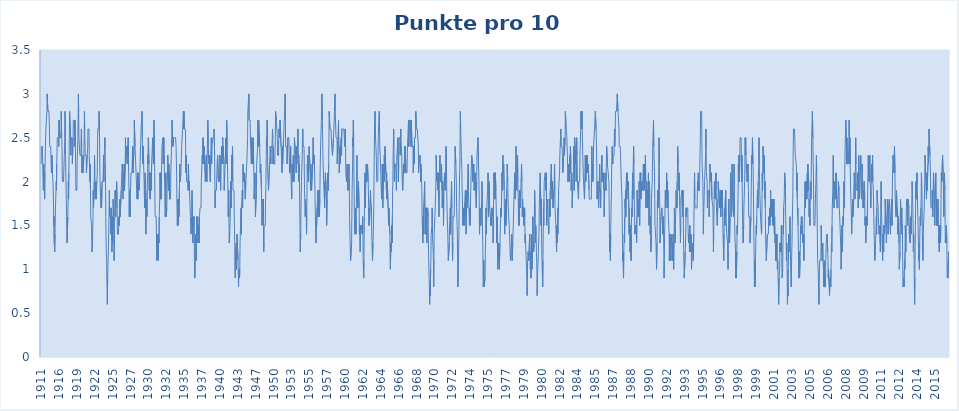
| Category | Punkte pro 10 Spiele |
|---|---|
| 1911 | 2.2 |
| 1911 | 2.4 |
| 1912 | 2.4 |
| 1912 | 2.4 |
| 1912 | 2.4 |
| 1912 | 2.4 |
| 1912 | 2.4 |
| 1912 | 2.1 |
| 1912 | 2.1 |
| 1912 | 1.9 |
| 1912 | 2.2 |
| 1912 | 2.2 |
| 1912 | 2.2 |
| 1912 | 2 |
| 1912 | 1.8 |
| 1912 | 2.1 |
| 1912 | 2.1 |
| 1912 | 2.4 |
| 1912 | 2.4 |
| 1912 | 2.6 |
| 1912 | 2.6 |
| 1913 | 2.6 |
| 1913 | 2.6 |
| 1913 | 2.8 |
| 1913 | 3 |
| 1913 | 3 |
| 1913 | 3 |
| 1913 | 2.8 |
| 1913 | 2.8 |
| 1913 | 2.8 |
| 1913 | 2.8 |
| 1913 | 2.8 |
| 1913 | 2.8 |
| 1913 | 2.6 |
| 1913 | 2.4 |
| 1913 | 2.4 |
| 1913 | 2.4 |
| 1913 | 2.4 |
| 1913 | 2.4 |
| 1914 | 2.4 |
| 1914 | 2.4 |
| 1914 | 2.1 |
| 1914 | 2.1 |
| 1914 | 2.3 |
| 1914 | 2.3 |
| 1914 | 2.1 |
| 1914 | 2.1 |
| 1914 | 2 |
| 1915 | 2 |
| 1915 | 1.8 |
| 1915 | 1.5 |
| 1915 | 1.6 |
| 1915 | 1.3 |
| 1915 | 1.3 |
| 1915 | 1.2 |
| 1915 | 1.4 |
| 1915 | 1.4 |
| 1915 | 1.7 |
| 1915 | 1.7 |
| 1915 | 1.9 |
| 1915 | 2 |
| 1915 | 1.9 |
| 1915 | 2.2 |
| 1915 | 2.2 |
| 1915 | 2.5 |
| 1915 | 2.5 |
| 1916 | 2.5 |
| 1916 | 2.5 |
| 1916 | 2.5 |
| 1916 | 2.5 |
| 1916 | 2.4 |
| 1916 | 2.7 |
| 1916 | 2.7 |
| 1916 | 2.7 |
| 1916 | 2.7 |
| 1916 | 2.5 |
| 1916 | 2.5 |
| 1916 | 2.5 |
| 1916 | 2.5 |
| 1916 | 2.5 |
| 1916 | 2.8 |
| 1916 | 2.6 |
| 1916 | 2.6 |
| 1916 | 2.4 |
| 1917 | 2.1 |
| 1917 | 2 |
| 1917 | 2 |
| 1917 | 2 |
| 1917 | 2 |
| 1917 | 2 |
| 1917 | 2 |
| 1917 | 2.2 |
| 1917 | 2.2 |
| 1917 | 2.2 |
| 1917 | 2.5 |
| 1917 | 2.8 |
| 1917 | 2.5 |
| 1917 | 2.3 |
| 1917 | 2.1 |
| 1917 | 2.1 |
| 1917 | 1.8 |
| 1917 | 1.6 |
| 1918 | 1.4 |
| 1918 | 1.3 |
| 1918 | 1.3 |
| 1918 | 1.3 |
| 1918 | 1.6 |
| 1918 | 1.8 |
| 1918 | 2 |
| 1918 | 1.8 |
| 1918 | 2.1 |
| 1918 | 2.3 |
| 1918 | 2.5 |
| 1918 | 2.8 |
| 1918 | 2.8 |
| 1918 | 2.8 |
| 1918 | 2.8 |
| 1918 | 2.5 |
| 1918 | 2.3 |
| 1918 | 2.5 |
| 1919 | 2.5 |
| 1919 | 2.5 |
| 1919 | 2.5 |
| 1919 | 2.5 |
| 1919 | 2.2 |
| 1919 | 2.2 |
| 1919 | 2.2 |
| 1919 | 2.5 |
| 1919 | 2.7 |
| 1919 | 2.7 |
| 1919 | 2.7 |
| 1919 | 2.7 |
| 1919 | 2.7 |
| 1919 | 2.4 |
| 1919 | 2.7 |
| 1919 | 2.7 |
| 1919 | 2.4 |
| 1919 | 2.2 |
| 1919 | 1.9 |
| 1919 | 1.9 |
| 1919 | 1.9 |
| 1919 | 1.9 |
| 1919 | 1.9 |
| 1919 | 2.2 |
| 1920 | 2.2 |
| 1920 | 2.2 |
| 1920 | 2.5 |
| 1920 | 2.7 |
| 1920 | 3 |
| 1920 | 2.8 |
| 1920 | 2.5 |
| 1920 | 2.5 |
| 1920 | 2.5 |
| 1920 | 2.5 |
| 1920 | 2.3 |
| 1920 | 2.3 |
| 1920 | 2.3 |
| 1920 | 2.3 |
| 1920 | 2.3 |
| 1920 | 2.5 |
| 1920 | 2.6 |
| 1920 | 2.4 |
| 1920 | 2.1 |
| 1920 | 2.1 |
| 1920 | 2.3 |
| 1920 | 2.3 |
| 1920 | 2.1 |
| 1920 | 2.1 |
| 1920 | 2.1 |
| 1920 | 2.1 |
| 1920 | 2.3 |
| 1921 | 2.5 |
| 1921 | 2.8 |
| 1921 | 2.6 |
| 1921 | 2.6 |
| 1921 | 2.3 |
| 1921 | 2.3 |
| 1921 | 2.3 |
| 1921 | 2.3 |
| 1921 | 2.3 |
| 1921 | 2.1 |
| 1921 | 2.1 |
| 1921 | 2.1 |
| 1921 | 2.3 |
| 1921 | 2.3 |
| 1921 | 2.4 |
| 1921 | 2.6 |
| 1921 | 2.6 |
| 1921 | 2.6 |
| 1921 | 2.6 |
| 1921 | 2.6 |
| 1921 | 2.3 |
| 1921 | 2.3 |
| 1921 | 2.3 |
| 1921 | 2 |
| 1921 | 2.2 |
| 1921 | 1.9 |
| 1922 | 1.6 |
| 1922 | 1.6 |
| 1922 | 1.6 |
| 1922 | 1.5 |
| 1922 | 1.5 |
| 1922 | 1.2 |
| 1922 | 1.2 |
| 1922 | 1.3 |
| 1922 | 1.3 |
| 1922 | 1.6 |
| 1922 | 1.9 |
| 1922 | 1.7 |
| 1922 | 1.7 |
| 1922 | 1.7 |
| 1922 | 2 |
| 1922 | 2.3 |
| 1922 | 2.1 |
| 1922 | 2 |
| 1922 | 1.8 |
| 1922 | 1.8 |
| 1922 | 1.8 |
| 1922 | 2 |
| 1922 | 1.8 |
| 1922 | 1.9 |
| 1922 | 1.9 |
| 1923 | 1.9 |
| 1923 | 2.1 |
| 1923 | 2.4 |
| 1923 | 2.6 |
| 1923 | 2.6 |
| 1923 | 2.6 |
| 1923 | 2.6 |
| 1923 | 2.6 |
| 1923 | 2.8 |
| 1923 | 2.8 |
| 1923 | 2.5 |
| 1923 | 2.2 |
| 1923 | 2 |
| 1923 | 2 |
| 1923 | 2 |
| 1923 | 2 |
| 1923 | 1.7 |
| 1923 | 1.9 |
| 1923 | 1.7 |
| 1923 | 1.7 |
| 1923 | 2 |
| 1923 | 2 |
| 1923 | 2 |
| 1923 | 2 |
| 1923 | 2 |
| 1923 | 2 |
| 1923 | 2.3 |
| 1923 | 2 |
| 1924 | 2.2 |
| 1924 | 2.2 |
| 1924 | 2.2 |
| 1924 | 2.5 |
| 1924 | 2.4 |
| 1924 | 2.2 |
| 1924 | 1.9 |
| 1924 | 1.6 |
| 1924 | 1.3 |
| 1924 | 1.3 |
| 1924 | 1.1 |
| 1924 | 0.9 |
| 1924 | 0.9 |
| 1924 | 0.6 |
| 1924 | 0.9 |
| 1924 | 0.9 |
| 1924 | 0.9 |
| 1924 | 1.2 |
| 1924 | 1.2 |
| 1924 | 1.5 |
| 1924 | 1.7 |
| 1924 | 1.9 |
| 1924 | 1.6 |
| 1924 | 1.6 |
| 1925 | 1.6 |
| 1925 | 1.6 |
| 1925 | 1.6 |
| 1925 | 1.4 |
| 1925 | 1.7 |
| 1925 | 1.5 |
| 1925 | 1.5 |
| 1925 | 1.2 |
| 1925 | 1.3 |
| 1925 | 1.6 |
| 1925 | 1.3 |
| 1925 | 1.5 |
| 1925 | 1.8 |
| 1925 | 1.7 |
| 1925 | 1.5 |
| 1925 | 1.4 |
| 1925 | 1.1 |
| 1925 | 1.4 |
| 1925 | 1.6 |
| 1925 | 1.6 |
| 1925 | 1.9 |
| 1926 | 1.9 |
| 1926 | 1.6 |
| 1926 | 1.9 |
| 1926 | 1.8 |
| 1926 | 1.9 |
| 1926 | 2 |
| 1926 | 2 |
| 1926 | 1.7 |
| 1926 | 1.4 |
| 1926 | 1.4 |
| 1926 | 1.4 |
| 1926 | 1.4 |
| 1926 | 1.4 |
| 1926 | 1.4 |
| 1926 | 1.6 |
| 1926 | 1.5 |
| 1926 | 1.5 |
| 1926 | 1.5 |
| 1926 | 1.8 |
| 1926 | 1.6 |
| 1926 | 1.6 |
| 1926 | 1.6 |
| 1926 | 1.6 |
| 1926 | 1.9 |
| 1926 | 1.9 |
| 1927 | 1.9 |
| 1927 | 1.9 |
| 1927 | 2.2 |
| 1927 | 2.2 |
| 1927 | 2.1 |
| 1927 | 1.8 |
| 1927 | 2.1 |
| 1927 | 2.1 |
| 1927 | 2.1 |
| 1927 | 1.9 |
| 1927 | 2.2 |
| 1927 | 1.9 |
| 1927 | 1.9 |
| 1927 | 1.9 |
| 1927 | 2.2 |
| 1927 | 2.5 |
| 1927 | 2.2 |
| 1927 | 2.2 |
| 1927 | 2.2 |
| 1927 | 2.4 |
| 1927 | 2.4 |
| 1927 | 2.4 |
| 1927 | 2.4 |
| 1927 | 2.4 |
| 1927 | 2.2 |
| 1927 | 2.2 |
| 1927 | 2.5 |
| 1927 | 2.2 |
| 1927 | 2.2 |
| 1927 | 1.9 |
| 1927 | 1.6 |
| 1927 | 1.9 |
| 1927 | 1.9 |
| 1927 | 1.6 |
| 1927 | 1.8 |
| 1927 | 1.8 |
| 1927 | 1.8 |
| 1928 | 2.1 |
| 1928 | 2.1 |
| 1928 | 2.1 |
| 1928 | 2.1 |
| 1928 | 2.1 |
| 1928 | 2.1 |
| 1928 | 2.4 |
| 1928 | 2.4 |
| 1928 | 2.1 |
| 1928 | 2.1 |
| 1928 | 2.1 |
| 1928 | 2.1 |
| 1928 | 2.4 |
| 1928 | 2.7 |
| 1928 | 2.7 |
| 1928 | 2.7 |
| 1928 | 2.4 |
| 1928 | 2.4 |
| 1928 | 2.4 |
| 1928 | 2.4 |
| 1928 | 2.1 |
| 1928 | 2.1 |
| 1928 | 2.1 |
| 1928 | 2.1 |
| 1928 | 1.8 |
| 1928 | 1.8 |
| 1928 | 2.1 |
| 1928 | 1.8 |
| 1928 | 2.1 |
| 1928 | 1.9 |
| 1928 | 1.9 |
| 1929 | 1.9 |
| 1929 | 1.9 |
| 1929 | 1.9 |
| 1929 | 2 |
| 1929 | 2 |
| 1929 | 2 |
| 1929 | 2.3 |
| 1929 | 2.3 |
| 1929 | 2.3 |
| 1929 | 2.6 |
| 1929 | 2.6 |
| 1929 | 2.6 |
| 1929 | 2.6 |
| 1929 | 2.8 |
| 1929 | 2.5 |
| 1929 | 2.2 |
| 1929 | 2.2 |
| 1929 | 2.2 |
| 1929 | 2.4 |
| 1929 | 2.2 |
| 1929 | 2.2 |
| 1929 | 2 |
| 1929 | 2 |
| 1929 | 1.7 |
| 1929 | 2 |
| 1929 | 2.1 |
| 1929 | 1.9 |
| 1929 | 1.7 |
| 1929 | 1.4 |
| 1929 | 1.6 |
| 1929 | 1.6 |
| 1929 | 1.8 |
| 1929 | 1.6 |
| 1929 | 1.9 |
| 1929 | 1.9 |
| 1930 | 2.1 |
| 1930 | 2.3 |
| 1930 | 2.2 |
| 1930 | 2.5 |
| 1930 | 2.5 |
| 1930 | 2.2 |
| 1930 | 1.9 |
| 1930 | 2.1 |
| 1930 | 2.1 |
| 1930 | 2.1 |
| 1930 | 1.8 |
| 1930 | 1.8 |
| 1930 | 2.1 |
| 1930 | 2.1 |
| 1930 | 1.9 |
| 1930 | 1.9 |
| 1930 | 2.2 |
| 1930 | 2.2 |
| 1930 | 2.2 |
| 1930 | 2.2 |
| 1930 | 2.5 |
| 1930 | 2.5 |
| 1930 | 2.5 |
| 1930 | 2.2 |
| 1930 | 2.4 |
| 1930 | 2.7 |
| 1930 | 2.7 |
| 1930 | 2.4 |
| 1930 | 2.1 |
| 1931 | 1.8 |
| 1931 | 1.6 |
| 1931 | 1.6 |
| 1931 | 1.6 |
| 1931 | 1.6 |
| 1931 | 1.6 |
| 1931 | 1.4 |
| 1931 | 1.1 |
| 1931 | 1.1 |
| 1931 | 1.2 |
| 1931 | 1.2 |
| 1931 | 1.4 |
| 1931 | 1.4 |
| 1931 | 1.1 |
| 1931 | 1.4 |
| 1931 | 1.4 |
| 1931 | 1.3 |
| 1931 | 1.6 |
| 1931 | 1.6 |
| 1931 | 1.8 |
| 1931 | 2.1 |
| 1931 | 2.1 |
| 1931 | 1.8 |
| 1931 | 2.1 |
| 1931 | 2.1 |
| 1931 | 1.8 |
| 1931 | 2.1 |
| 1931 | 2.1 |
| 1931 | 2.4 |
| 1932 | 2.4 |
| 1932 | 2.4 |
| 1932 | 2.4 |
| 1932 | 2.5 |
| 1932 | 2.2 |
| 1932 | 2.2 |
| 1932 | 2.5 |
| 1932 | 2.5 |
| 1932 | 2.2 |
| 1932 | 2.2 |
| 1932 | 1.9 |
| 1932 | 1.9 |
| 1932 | 1.6 |
| 1932 | 1.8 |
| 1932 | 2.1 |
| 1932 | 1.9 |
| 1932 | 1.6 |
| 1932 | 1.6 |
| 1932 | 1.7 |
| 1932 | 1.7 |
| 1932 | 2 |
| 1932 | 2 |
| 1932 | 2.3 |
| 1932 | 2.3 |
| 1932 | 2 |
| 1932 | 1.9 |
| 1933 | 2.2 |
| 1933 | 1.9 |
| 1933 | 2.1 |
| 1933 | 1.8 |
| 1933 | 1.8 |
| 1933 | 1.8 |
| 1933 | 1.8 |
| 1933 | 1.8 |
| 1933 | 2.1 |
| 1933 | 2.1 |
| 1933 | 2.1 |
| 1933 | 2.4 |
| 1933 | 2.4 |
| 1933 | 2.7 |
| 1933 | 2.7 |
| 1933 | 2.7 |
| 1933 | 2.4 |
| 1933 | 2.4 |
| 1933 | 2.4 |
| 1933 | 2.5 |
| 1933 | 2.5 |
| 1933 | 2.5 |
| 1933 | 2.5 |
| 1933 | 2.5 |
| 1934 | 2.5 |
| 1934 | 2.5 |
| 1934 | 2.5 |
| 1934 | 2.5 |
| 1934 | 2.5 |
| 1934 | 2.4 |
| 1934 | 2.4 |
| 1934 | 2.1 |
| 1934 | 1.8 |
| 1934 | 1.8 |
| 1934 | 1.5 |
| 1934 | 1.5 |
| 1934 | 1.8 |
| 1934 | 1.8 |
| 1934 | 1.5 |
| 1934 | 1.8 |
| 1934 | 1.6 |
| 1934 | 1.6 |
| 1934 | 1.9 |
| 1934 | 1.9 |
| 1934 | 2.2 |
| 1934 | 2 |
| 1934 | 2 |
| 1934 | 2 |
| 1934 | 2.1 |
| 1934 | 2.1 |
| 1934 | 2.1 |
| 1934 | 2.4 |
| 1934 | 2.4 |
| 1934 | 2.4 |
| 1935 | 2.4 |
| 1935 | 2.6 |
| 1935 | 2.6 |
| 1935 | 2.6 |
| 1935 | 2.8 |
| 1935 | 2.6 |
| 1935 | 2.8 |
| 1935 | 2.8 |
| 1935 | 2.6 |
| 1935 | 2.6 |
| 1935 | 2.6 |
| 1935 | 2.6 |
| 1935 | 2.6 |
| 1935 | 2.4 |
| 1935 | 2.1 |
| 1935 | 2.3 |
| 1935 | 2.3 |
| 1935 | 2 |
| 1935 | 2 |
| 1935 | 2 |
| 1935 | 2 |
| 1935 | 2 |
| 1935 | 2 |
| 1935 | 1.9 |
| 1935 | 2.2 |
| 1935 | 2.2 |
| 1935 | 1.9 |
| 1935 | 2 |
| 1935 | 1.9 |
| 1935 | 1.9 |
| 1935 | 1.9 |
| 1935 | 1.9 |
| 1936 | 1.6 |
| 1936 | 1.6 |
| 1936 | 1.4 |
| 1936 | 1.4 |
| 1936 | 1.4 |
| 1936 | 1.6 |
| 1936 | 1.9 |
| 1936 | 1.9 |
| 1936 | 1.6 |
| 1936 | 1.3 |
| 1936 | 1.3 |
| 1936 | 1.6 |
| 1936 | 1.5 |
| 1936 | 1.5 |
| 1936 | 1.6 |
| 1936 | 1.3 |
| 1936 | 1.1 |
| 1936 | 0.9 |
| 1936 | 0.9 |
| 1936 | 1 |
| 1936 | 1.3 |
| 1936 | 1.3 |
| 1936 | 1.4 |
| 1936 | 1.1 |
| 1936 | 1.3 |
| 1937 | 1.6 |
| 1937 | 1.5 |
| 1937 | 1.4 |
| 1937 | 1.4 |
| 1937 | 1.6 |
| 1937 | 1.3 |
| 1937 | 1.3 |
| 1937 | 1.5 |
| 1937 | 1.5 |
| 1937 | 1.3 |
| 1937 | 1.3 |
| 1937 | 1.6 |
| 1937 | 1.6 |
| 1937 | 1.7 |
| 1937 | 1.7 |
| 1937 | 1.7 |
| 1937 | 1.7 |
| 1937 | 1.7 |
| 1937 | 2 |
| 1937 | 2 |
| 1937 | 2 |
| 1937 | 2 |
| 1937 | 2.3 |
| 1938 | 2.2 |
| 1938 | 2.2 |
| 1938 | 2.5 |
| 1938 | 2.5 |
| 1938 | 2.5 |
| 1938 | 2.2 |
| 1938 | 2.4 |
| 1938 | 2.4 |
| 1938 | 2.2 |
| 1938 | 2.2 |
| 1938 | 2.2 |
| 1938 | 2 |
| 1938 | 2 |
| 1938 | 2 |
| 1938 | 2 |
| 1938 | 2.3 |
| 1938 | 2.3 |
| 1938 | 2 |
| 1938 | 2.2 |
| 1938 | 2.2 |
| 1938 | 2.5 |
| 1938 | 2.7 |
| 1939 | 2.7 |
| 1939 | 2.4 |
| 1939 | 2.4 |
| 1939 | 2.2 |
| 1939 | 2.2 |
| 1939 | 2.3 |
| 1939 | 2.3 |
| 1939 | 2.3 |
| 1939 | 2.3 |
| 1939 | 2 |
| 1939 | 2 |
| 1939 | 2.3 |
| 1939 | 2.3 |
| 1939 | 2.5 |
| 1939 | 2.2 |
| 1939 | 2.4 |
| 1939 | 2.4 |
| 1939 | 2.4 |
| 1939 | 2.4 |
| 1939 | 2.5 |
| 1939 | 2.5 |
| 1940 | 2.5 |
| 1940 | 2.5 |
| 1940 | 2.5 |
| 1940 | 2.6 |
| 1940 | 2.6 |
| 1940 | 2.3 |
| 1940 | 2 |
| 1940 | 1.7 |
| 1940 | 1.9 |
| 1940 | 1.9 |
| 1940 | 1.9 |
| 1940 | 1.9 |
| 1940 | 1.9 |
| 1940 | 1.9 |
| 1940 | 1.9 |
| 1940 | 2.2 |
| 1940 | 2.2 |
| 1940 | 2.3 |
| 1940 | 2.3 |
| 1940 | 2.3 |
| 1940 | 2 |
| 1940 | 2 |
| 1940 | 2 |
| 1940 | 2 |
| 1940 | 2 |
| 1940 | 2 |
| 1940 | 2.3 |
| 1940 | 2.2 |
| 1940 | 2.2 |
| 1940 | 1.9 |
| 1940 | 2.2 |
| 1940 | 2.2 |
| 1941 | 2.2 |
| 1941 | 2.4 |
| 1941 | 2.4 |
| 1941 | 2.2 |
| 1941 | 2.2 |
| 1941 | 2.5 |
| 1941 | 2.3 |
| 1941 | 2.4 |
| 1941 | 2.4 |
| 1941 | 2.4 |
| 1941 | 2.2 |
| 1941 | 1.9 |
| 1941 | 1.9 |
| 1941 | 2.1 |
| 1941 | 2.1 |
| 1941 | 2.1 |
| 1941 | 2.3 |
| 1941 | 2.5 |
| 1941 | 2.5 |
| 1941 | 2.2 |
| 1941 | 2.4 |
| 1941 | 2.7 |
| 1941 | 2.7 |
| 1941 | 2.4 |
| 1941 | 2.2 |
| 1941 | 2.2 |
| 1941 | 1.9 |
| 1941 | 1.6 |
| 1941 | 1.6 |
| 1942 | 1.9 |
| 1942 | 1.6 |
| 1942 | 1.3 |
| 1942 | 1.3 |
| 1942 | 1.4 |
| 1942 | 1.4 |
| 1942 | 1.4 |
| 1942 | 1.7 |
| 1942 | 2 |
| 1942 | 2 |
| 1942 | 1.7 |
| 1942 | 2 |
| 1942 | 2.3 |
| 1942 | 2 |
| 1942 | 2.2 |
| 1942 | 2.4 |
| 1942 | 2.2 |
| 1942 | 1.9 |
| 1942 | 1.9 |
| 1942 | 1.9 |
| 1942 | 1.9 |
| 1942 | 1.9 |
| 1942 | 1.6 |
| 1943 | 1.6 |
| 1943 | 1.3 |
| 1943 | 1 |
| 1943 | 0.9 |
| 1943 | 1.2 |
| 1943 | 1.2 |
| 1943 | 1.2 |
| 1943 | 1.3 |
| 1943 | 1 |
| 1943 | 1.3 |
| 1943 | 1.4 |
| 1943 | 1.4 |
| 1943 | 1.4 |
| 1943 | 1.4 |
| 1943 | 1.1 |
| 1943 | 1.1 |
| 1943 | 0.8 |
| 1943 | 1 |
| 1943 | 1 |
| 1944 | 1 |
| 1944 | 0.9 |
| 1944 | 1 |
| 1944 | 1.3 |
| 1944 | 1.4 |
| 1944 | 1.4 |
| 1944 | 1.4 |
| 1944 | 1.7 |
| 1944 | 1.4 |
| 1944 | 1.7 |
| 1944 | 1.7 |
| 1944 | 1.7 |
| 1944 | 1.9 |
| 1944 | 1.7 |
| 1944 | 1.9 |
| 1944 | 2.2 |
| 1944 | 2 |
| 1945 | 2 |
| 1945 | 2 |
| 1945 | 2 |
| 1945 | 2 |
| 1945 | 2.1 |
| 1945 | 2.1 |
| 1945 | 2.1 |
| 1945 | 1.8 |
| 1945 | 1.8 |
| 1945 | 2 |
| 1945 | 2 |
| 1945 | 2.1 |
| 1945 | 2.1 |
| 1946 | 2.1 |
| 1946 | 2.3 |
| 1946 | 2.3 |
| 1946 | 2.5 |
| 1946 | 2.8 |
| 1946 | 2.8 |
| 1946 | 2.8 |
| 1946 | 2.8 |
| 1946 | 3 |
| 1946 | 2.7 |
| 1946 | 2.7 |
| 1946 | 2.7 |
| 1946 | 2.7 |
| 1946 | 2.7 |
| 1946 | 2.7 |
| 1946 | 2.4 |
| 1946 | 2.4 |
| 1946 | 2.4 |
| 1946 | 2.2 |
| 1946 | 2.5 |
| 1946 | 2.5 |
| 1946 | 2.5 |
| 1946 | 2.2 |
| 1946 | 2.2 |
| 1946 | 2.2 |
| 1946 | 2.5 |
| 1946 | 2.5 |
| 1947 | 2.2 |
| 1947 | 2.1 |
| 1947 | 1.8 |
| 1947 | 1.8 |
| 1947 | 1.8 |
| 1947 | 2.1 |
| 1947 | 1.9 |
| 1947 | 1.6 |
| 1947 | 1.6 |
| 1947 | 1.6 |
| 1947 | 1.6 |
| 1947 | 1.9 |
| 1947 | 2.2 |
| 1947 | 2.2 |
| 1947 | 2.2 |
| 1947 | 2.2 |
| 1947 | 2.4 |
| 1947 | 2.7 |
| 1947 | 2.4 |
| 1947 | 2.4 |
| 1947 | 2.7 |
| 1947 | 2.7 |
| 1947 | 2.7 |
| 1948 | 2.7 |
| 1948 | 2.4 |
| 1948 | 2.4 |
| 1948 | 2.1 |
| 1948 | 2.1 |
| 1948 | 2.2 |
| 1948 | 2.2 |
| 1948 | 2.2 |
| 1948 | 1.9 |
| 1948 | 1.7 |
| 1948 | 1.5 |
| 1948 | 1.5 |
| 1948 | 1.5 |
| 1948 | 1.8 |
| 1948 | 1.6 |
| 1948 | 1.8 |
| 1948 | 1.5 |
| 1948 | 1.2 |
| 1948 | 1.3 |
| 1948 | 1.5 |
| 1949 | 1.5 |
| 1949 | 1.5 |
| 1949 | 1.5 |
| 1949 | 1.5 |
| 1949 | 1.7 |
| 1949 | 1.7 |
| 1949 | 2 |
| 1949 | 2.3 |
| 1949 | 2.5 |
| 1949 | 2.5 |
| 1949 | 2.4 |
| 1949 | 2.7 |
| 1949 | 2.4 |
| 1949 | 2.1 |
| 1949 | 2.1 |
| 1949 | 2.1 |
| 1949 | 1.9 |
| 1949 | 1.9 |
| 1949 | 1.9 |
| 1949 | 1.9 |
| 1949 | 2.2 |
| 1949 | 2.2 |
| 1949 | 2.3 |
| 1950 | 2.4 |
| 1950 | 2.4 |
| 1950 | 2.2 |
| 1950 | 2.4 |
| 1950 | 2.4 |
| 1950 | 2.4 |
| 1950 | 2.4 |
| 1950 | 2.4 |
| 1950 | 2.4 |
| 1950 | 2.6 |
| 1950 | 2.5 |
| 1950 | 2.2 |
| 1950 | 2.4 |
| 1950 | 2.4 |
| 1950 | 2.2 |
| 1950 | 2.2 |
| 1950 | 2.2 |
| 1950 | 2.2 |
| 1950 | 2.2 |
| 1950 | 2.2 |
| 1950 | 2.5 |
| 1950 | 2.8 |
| 1950 | 2.8 |
| 1950 | 2.8 |
| 1951 | 2.7 |
| 1951 | 2.7 |
| 1951 | 2.7 |
| 1951 | 2.7 |
| 1951 | 2.5 |
| 1951 | 2.3 |
| 1951 | 2.3 |
| 1951 | 2.3 |
| 1951 | 2.3 |
| 1951 | 2.3 |
| 1951 | 2.6 |
| 1951 | 2.6 |
| 1951 | 2.6 |
| 1951 | 2.6 |
| 1951 | 2.5 |
| 1951 | 2.7 |
| 1951 | 2.7 |
| 1951 | 2.7 |
| 1951 | 2.7 |
| 1951 | 2.4 |
| 1951 | 2.4 |
| 1951 | 2.4 |
| 1951 | 2.4 |
| 1951 | 2.1 |
| 1951 | 2.4 |
| 1951 | 2.2 |
| 1951 | 2.2 |
| 1952 | 2.2 |
| 1952 | 2.2 |
| 1952 | 2.5 |
| 1952 | 2.5 |
| 1952 | 2.5 |
| 1952 | 2.5 |
| 1952 | 2.8 |
| 1952 | 2.8 |
| 1952 | 3 |
| 1952 | 2.7 |
| 1952 | 2.4 |
| 1952 | 2.4 |
| 1952 | 2.4 |
| 1952 | 2.4 |
| 1952 | 2.4 |
| 1952 | 2.4 |
| 1952 | 2.2 |
| 1952 | 2.2 |
| 1952 | 2.2 |
| 1952 | 2.5 |
| 1952 | 2.5 |
| 1952 | 2.5 |
| 1952 | 2.5 |
| 1952 | 2.5 |
| 1952 | 2.5 |
| 1952 | 2.2 |
| 1953 | 2.1 |
| 1953 | 2.1 |
| 1953 | 2.1 |
| 1953 | 2.1 |
| 1953 | 2.4 |
| 1953 | 2.1 |
| 1953 | 2.1 |
| 1953 | 2.1 |
| 1953 | 1.8 |
| 1953 | 1.9 |
| 1953 | 2.2 |
| 1953 | 2 |
| 1953 | 2 |
| 1953 | 2 |
| 1953 | 2 |
| 1953 | 2.3 |
| 1953 | 2.3 |
| 1953 | 2 |
| 1953 | 2.3 |
| 1953 | 2.5 |
| 1953 | 2.5 |
| 1953 | 2.5 |
| 1953 | 2.5 |
| 1953 | 2.3 |
| 1953 | 2.3 |
| 1953 | 2.3 |
| 1953 | 2.1 |
| 1953 | 2.4 |
| 1953 | 2.2 |
| 1954 | 2.2 |
| 1954 | 2.2 |
| 1954 | 2.4 |
| 1954 | 2.4 |
| 1954 | 2.6 |
| 1954 | 2.4 |
| 1954 | 2.1 |
| 1954 | 2.3 |
| 1954 | 2 |
| 1954 | 2.2 |
| 1954 | 2 |
| 1954 | 1.7 |
| 1954 | 1.5 |
| 1954 | 1.2 |
| 1954 | 1.2 |
| 1954 | 1.4 |
| 1954 | 1.7 |
| 1954 | 1.7 |
| 1954 | 2 |
| 1954 | 2 |
| 1954 | 2.2 |
| 1954 | 2.3 |
| 1954 | 2.3 |
| 1955 | 2.6 |
| 1955 | 2.4 |
| 1955 | 2.4 |
| 1955 | 2.4 |
| 1955 | 2.4 |
| 1955 | 2.4 |
| 1955 | 2.2 |
| 1955 | 1.9 |
| 1955 | 1.8 |
| 1955 | 1.8 |
| 1955 | 1.6 |
| 1955 | 1.8 |
| 1955 | 1.8 |
| 1955 | 1.8 |
| 1955 | 1.6 |
| 1955 | 1.4 |
| 1955 | 1.6 |
| 1955 | 1.9 |
| 1955 | 2.2 |
| 1955 | 2.1 |
| 1955 | 2.3 |
| 1955 | 2.3 |
| 1955 | 2 |
| 1955 | 2 |
| 1955 | 2.2 |
| 1955 | 2.4 |
| 1955 | 2.4 |
| 1955 | 2.4 |
| 1956 | 2.2 |
| 1956 | 2.2 |
| 1956 | 2.2 |
| 1956 | 1.9 |
| 1956 | 2.2 |
| 1956 | 2.2 |
| 1956 | 2.2 |
| 1956 | 1.9 |
| 1956 | 1.9 |
| 1956 | 1.9 |
| 1956 | 1.9 |
| 1956 | 2.2 |
| 1956 | 2.2 |
| 1956 | 2.5 |
| 1956 | 2.5 |
| 1956 | 2.5 |
| 1956 | 2.2 |
| 1956 | 2.3 |
| 1956 | 2.3 |
| 1956 | 2.1 |
| 1956 | 2.1 |
| 1956 | 1.8 |
| 1956 | 1.6 |
| 1956 | 1.6 |
| 1956 | 1.6 |
| 1956 | 1.3 |
| 1956 | 1.6 |
| 1956 | 1.5 |
| 1956 | 1.5 |
| 1956 | 1.7 |
| 1956 | 1.7 |
| 1956 | 1.7 |
| 1956 | 1.9 |
| 1956 | 1.6 |
| 1956 | 1.6 |
| 1956 | 1.9 |
| 1956 | 1.6 |
| 1956 | 1.9 |
| 1956 | 1.6 |
| 1957 | 1.6 |
| 1957 | 1.8 |
| 1957 | 2.1 |
| 1957 | 2.1 |
| 1957 | 2.4 |
| 1957 | 2.4 |
| 1957 | 2.4 |
| 1957 | 2.7 |
| 1957 | 2.7 |
| 1957 | 3 |
| 1957 | 3 |
| 1957 | 2.7 |
| 1957 | 2.5 |
| 1957 | 2.3 |
| 1957 | 2.3 |
| 1957 | 2.3 |
| 1957 | 2 |
| 1957 | 2 |
| 1957 | 2 |
| 1957 | 2 |
| 1957 | 1.7 |
| 1957 | 2 |
| 1957 | 1.9 |
| 1957 | 2.1 |
| 1957 | 2.1 |
| 1957 | 2.1 |
| 1957 | 2.1 |
| 1957 | 1.8 |
| 1957 | 1.5 |
| 1957 | 1.5 |
| 1957 | 1.8 |
| 1957 | 1.8 |
| 1957 | 2.1 |
| 1957 | 2.1 |
| 1958 | 2.1 |
| 1958 | 1.9 |
| 1958 | 2.2 |
| 1958 | 2.5 |
| 1958 | 2.8 |
| 1958 | 2.8 |
| 1958 | 2.8 |
| 1958 | 2.6 |
| 1958 | 2.6 |
| 1958 | 2.6 |
| 1958 | 2.6 |
| 1958 | 2.6 |
| 1958 | 2.6 |
| 1958 | 2.6 |
| 1958 | 2.4 |
| 1958 | 2.4 |
| 1958 | 2.4 |
| 1958 | 2.3 |
| 1958 | 2.3 |
| 1958 | 2.3 |
| 1958 | 2.3 |
| 1958 | 2.5 |
| 1958 | 2.5 |
| 1958 | 2.5 |
| 1958 | 2.7 |
| 1959 | 2.7 |
| 1959 | 2.7 |
| 1959 | 3 |
| 1959 | 2.8 |
| 1959 | 2.8 |
| 1959 | 2.8 |
| 1959 | 2.5 |
| 1959 | 2.5 |
| 1959 | 2.5 |
| 1959 | 2.5 |
| 1959 | 2.5 |
| 1959 | 2.2 |
| 1959 | 2.2 |
| 1959 | 2.4 |
| 1959 | 2.4 |
| 1959 | 2.4 |
| 1959 | 2.7 |
| 1959 | 2.4 |
| 1959 | 2.4 |
| 1959 | 2.1 |
| 1959 | 2.1 |
| 1959 | 2.4 |
| 1959 | 2.4 |
| 1959 | 2.2 |
| 1959 | 2.2 |
| 1959 | 2.2 |
| 1959 | 2.2 |
| 1959 | 2.5 |
| 1959 | 2.3 |
| 1959 | 2.6 |
| 1959 | 2.6 |
| 1960 | 2.6 |
| 1960 | 2.6 |
| 1960 | 2.6 |
| 1960 | 2.6 |
| 1960 | 2.6 |
| 1960 | 2.6 |
| 1960 | 2.6 |
| 1960 | 2.6 |
| 1960 | 2.6 |
| 1960 | 2.6 |
| 1960 | 2.4 |
| 1960 | 2.4 |
| 1960 | 2.6 |
| 1960 | 2.4 |
| 1960 | 2.1 |
| 1960 | 2.1 |
| 1960 | 2.1 |
| 1960 | 2 |
| 1960 | 2 |
| 1960 | 2 |
| 1960 | 2.2 |
| 1960 | 2.2 |
| 1960 | 1.9 |
| 1960 | 2.1 |
| 1960 | 2.1 |
| 1960 | 2.1 |
| 1960 | 2.1 |
| 1960 | 2.2 |
| 1960 | 1.9 |
| 1960 | 1.6 |
| 1960 | 1.6 |
| 1960 | 1.3 |
| 1960 | 1.3 |
| 1960 | 1.1 |
| 1960 | 1.1 |
| 1960 | 1.1 |
| 1960 | 1.1 |
| 1961 | 1.3 |
| 1961 | 1.6 |
| 1961 | 1.9 |
| 1961 | 1.9 |
| 1961 | 2.2 |
| 1961 | 2.5 |
| 1961 | 2.4 |
| 1961 | 2.7 |
| 1961 | 2.5 |
| 1961 | 2.2 |
| 1961 | 1.9 |
| 1961 | 1.6 |
| 1961 | 1.6 |
| 1961 | 1.4 |
| 1961 | 1.4 |
| 1961 | 1.4 |
| 1961 | 1.7 |
| 1961 | 1.4 |
| 1961 | 1.6 |
| 1961 | 1.7 |
| 1961 | 2 |
| 1961 | 2.3 |
| 1961 | 2 |
| 1961 | 2 |
| 1961 | 2 |
| 1961 | 1.7 |
| 1961 | 1.7 |
| 1961 | 2 |
| 1961 | 2 |
| 1961 | 2 |
| 1961 | 1.7 |
| 1961 | 1.4 |
| 1961 | 1.5 |
| 1961 | 1.4 |
| 1961 | 1.2 |
| 1961 | 1.5 |
| 1961 | 1.5 |
| 1961 | 1.5 |
| 1961 | 1.5 |
| 1962 | 1.5 |
| 1962 | 1.5 |
| 1962 | 1.5 |
| 1962 | 1.4 |
| 1962 | 1.4 |
| 1962 | 1.6 |
| 1962 | 1.4 |
| 1962 | 1.1 |
| 1962 | 1.1 |
| 1962 | 0.9 |
| 1962 | 1.1 |
| 1962 | 1.4 |
| 1962 | 1.7 |
| 1962 | 2 |
| 1962 | 2.1 |
| 1962 | 1.8 |
| 1962 | 1.7 |
| 1962 | 2 |
| 1962 | 2 |
| 1962 | 2.2 |
| 1962 | 2.2 |
| 1962 | 2 |
| 1962 | 2 |
| 1962 | 2 |
| 1962 | 2.2 |
| 1962 | 2.2 |
| 1962 | 2.2 |
| 1962 | 2 |
| 1962 | 2 |
| 1962 | 1.7 |
| 1963 | 1.5 |
| 1963 | 1.7 |
| 1963 | 1.5 |
| 1963 | 1.5 |
| 1963 | 1.5 |
| 1963 | 1.8 |
| 1963 | 1.9 |
| 1963 | 1.8 |
| 1963 | 1.8 |
| 1963 | 1.8 |
| 1963 | 1.7 |
| 1963 | 1.4 |
| 1963 | 1.3 |
| 1963 | 1.3 |
| 1963 | 1.1 |
| 1963 | 1.1 |
| 1963 | 1.3 |
| 1963 | 1.4 |
| 1963 | 1.4 |
| 1963 | 1.7 |
| 1963 | 2 |
| 1963 | 2.3 |
| 1963 | 2.6 |
| 1963 | 2.6 |
| 1963 | 2.8 |
| 1963 | 2.8 |
| 1963 | 2.5 |
| 1963 | 2.5 |
| 1963 | 2.5 |
| 1963 | 2.3 |
| 1963 | 2.3 |
| 1963 | 2 |
| 1963 | 2 |
| 1963 | 2 |
| 1963 | 2 |
| 1964 | 2 |
| 1964 | 2.3 |
| 1964 | 2.5 |
| 1964 | 2.5 |
| 1964 | 2.7 |
| 1964 | 2.7 |
| 1964 | 2.8 |
| 1964 | 2.6 |
| 1964 | 2.4 |
| 1964 | 2.4 |
| 1964 | 2.4 |
| 1964 | 2.4 |
| 1964 | 2.1 |
| 1964 | 2.1 |
| 1964 | 1.9 |
| 1964 | 1.9 |
| 1964 | 1.8 |
| 1964 | 2 |
| 1964 | 2.2 |
| 1964 | 1.9 |
| 1964 | 1.7 |
| 1964 | 1.7 |
| 1964 | 2 |
| 1964 | 2 |
| 1964 | 2.2 |
| 1964 | 2 |
| 1964 | 2.3 |
| 1964 | 2.3 |
| 1964 | 2.1 |
| 1964 | 2.4 |
| 1964 | 2.4 |
| 1964 | 2.4 |
| 1964 | 2.1 |
| 1964 | 2.1 |
| 1964 | 1.9 |
| 1964 | 2.1 |
| 1964 | 1.8 |
| 1964 | 1.8 |
| 1965 | 2 |
| 1965 | 2 |
| 1965 | 2 |
| 1965 | 1.7 |
| 1965 | 1.7 |
| 1965 | 1.5 |
| 1965 | 1.7 |
| 1965 | 1.7 |
| 1965 | 1.7 |
| 1965 | 1.7 |
| 1965 | 1.4 |
| 1965 | 1.1 |
| 1965 | 1 |
| 1965 | 1 |
| 1965 | 1.3 |
| 1965 | 1.2 |
| 1965 | 1.2 |
| 1965 | 1.2 |
| 1965 | 1.5 |
| 1965 | 1.3 |
| 1965 | 1.6 |
| 1965 | 1.9 |
| 1965 | 2 |
| 1965 | 2.3 |
| 1965 | 2.3 |
| 1965 | 2.6 |
| 1965 | 2.4 |
| 1965 | 2.2 |
| 1965 | 2 |
| 1965 | 2.2 |
| 1966 | 2.2 |
| 1966 | 2.2 |
| 1966 | 2.2 |
| 1966 | 2.2 |
| 1966 | 2.2 |
| 1966 | 2 |
| 1966 | 1.9 |
| 1966 | 2.1 |
| 1966 | 2.3 |
| 1966 | 2.3 |
| 1966 | 2.3 |
| 1966 | 2.3 |
| 1966 | 2.5 |
| 1966 | 2.2 |
| 1966 | 2 |
| 1966 | 2.2 |
| 1966 | 2.5 |
| 1966 | 2.5 |
| 1966 | 2.5 |
| 1966 | 2.5 |
| 1966 | 2.5 |
| 1966 | 2.3 |
| 1966 | 2.3 |
| 1966 | 2.6 |
| 1966 | 2.5 |
| 1966 | 2.5 |
| 1966 | 2.5 |
| 1966 | 2.3 |
| 1966 | 2.3 |
| 1966 | 2 |
| 1966 | 2 |
| 1966 | 1.9 |
| 1966 | 1.9 |
| 1966 | 1.9 |
| 1967 | 2.2 |
| 1967 | 2.2 |
| 1967 | 2.2 |
| 1967 | 2.1 |
| 1967 | 2.1 |
| 1967 | 2.4 |
| 1967 | 2.1 |
| 1967 | 2.4 |
| 1967 | 2.4 |
| 1967 | 2.4 |
| 1967 | 2.1 |
| 1967 | 2.1 |
| 1967 | 2.1 |
| 1967 | 2.1 |
| 1967 | 2.1 |
| 1967 | 2.1 |
| 1967 | 2.4 |
| 1967 | 2.4 |
| 1967 | 2.4 |
| 1967 | 2.4 |
| 1967 | 2.7 |
| 1967 | 2.4 |
| 1967 | 2.4 |
| 1967 | 2.7 |
| 1967 | 2.7 |
| 1967 | 2.7 |
| 1967 | 2.7 |
| 1967 | 2.7 |
| 1967 | 2.7 |
| 1967 | 2.7 |
| 1967 | 2.4 |
| 1967 | 2.7 |
| 1967 | 2.7 |
| 1967 | 2.7 |
| 1967 | 2.4 |
| 1967 | 2.4 |
| 1967 | 2.4 |
| 1968 | 2.4 |
| 1968 | 2.4 |
| 1968 | 2.1 |
| 1968 | 2.4 |
| 1968 | 2.4 |
| 1968 | 2.4 |
| 1968 | 2.2 |
| 1968 | 2.5 |
| 1968 | 2.5 |
| 1968 | 2.5 |
| 1968 | 2.5 |
| 1968 | 2.5 |
| 1968 | 2.8 |
| 1968 | 2.8 |
| 1968 | 2.6 |
| 1968 | 2.6 |
| 1968 | 2.6 |
| 1968 | 2.6 |
| 1968 | 2.6 |
| 1968 | 2.6 |
| 1968 | 2.6 |
| 1968 | 2.6 |
| 1968 | 2.4 |
| 1968 | 2.1 |
| 1968 | 2.1 |
| 1968 | 2.1 |
| 1968 | 2.3 |
| 1968 | 2.3 |
| 1968 | 2.3 |
| 1968 | 2.3 |
| 1968 | 2.3 |
| 1968 | 2 |
| 1968 | 2.2 |
| 1968 | 2.2 |
| 1969 | 2.1 |
| 1969 | 2.1 |
| 1969 | 1.9 |
| 1969 | 1.6 |
| 1969 | 1.6 |
| 1969 | 1.6 |
| 1969 | 1.3 |
| 1969 | 1.6 |
| 1969 | 1.4 |
| 1969 | 1.7 |
| 1969 | 1.7 |
| 1969 | 1.7 |
| 1969 | 1.9 |
| 1969 | 2 |
| 1969 | 1.7 |
| 1969 | 1.4 |
| 1969 | 1.7 |
| 1969 | 1.5 |
| 1969 | 1.7 |
| 1969 | 1.4 |
| 1969 | 1.7 |
| 1969 | 1.5 |
| 1969 | 1.3 |
| 1969 | 1.5 |
| 1969 | 1.6 |
| 1969 | 1.7 |
| 1969 | 1.7 |
| 1969 | 1.6 |
| 1969 | 1.3 |
| 1969 | 1.3 |
| 1969 | 1 |
| 1969 | 0.9 |
| 1969 | 0.8 |
| 1969 | 0.6 |
| 1969 | 0.8 |
| 1969 | 0.7 |
| 1969 | 0.7 |
| 1969 | 1 |
| 1969 | 1.1 |
| 1969 | 1.4 |
| 1970 | 1.4 |
| 1970 | 1.4 |
| 1970 | 1.5 |
| 1970 | 1.7 |
| 1970 | 1.4 |
| 1970 | 1.4 |
| 1970 | 1.4 |
| 1970 | 1.2 |
| 1970 | 1.1 |
| 1970 | 0.8 |
| 1970 | 1.1 |
| 1970 | 1.4 |
| 1970 | 1.4 |
| 1970 | 1.4 |
| 1970 | 1.4 |
| 1970 | 1.7 |
| 1970 | 1.7 |
| 1970 | 1.7 |
| 1970 | 2 |
| 1970 | 2.3 |
| 1970 | 2.3 |
| 1970 | 2 |
| 1970 | 2 |
| 1970 | 2 |
| 1970 | 2.1 |
| 1970 | 2.1 |
| 1970 | 1.9 |
| 1970 | 2.1 |
| 1970 | 2.1 |
| 1970 | 1.8 |
| 1970 | 1.6 |
| 1970 | 1.9 |
| 1970 | 2.1 |
| 1971 | 2.1 |
| 1971 | 2.3 |
| 1971 | 2 |
| 1971 | 2 |
| 1971 | 2 |
| 1971 | 2 |
| 1971 | 2 |
| 1971 | 2.2 |
| 1971 | 2.2 |
| 1971 | 1.9 |
| 1971 | 1.7 |
| 1971 | 1.7 |
| 1971 | 2 |
| 1971 | 2 |
| 1971 | 1.8 |
| 1971 | 1.5 |
| 1971 | 1.8 |
| 1971 | 1.8 |
| 1971 | 1.8 |
| 1971 | 2.1 |
| 1971 | 2.1 |
| 1971 | 2.1 |
| 1971 | 1.9 |
| 1971 | 2.1 |
| 1971 | 2.3 |
| 1971 | 2.4 |
| 1971 | 2.4 |
| 1971 | 2.1 |
| 1971 | 1.9 |
| 1971 | 1.7 |
| 1971 | 1.7 |
| 1971 | 1.5 |
| 1971 | 1.4 |
| 1971 | 1.4 |
| 1971 | 1.1 |
| 1971 | 1.1 |
| 1971 | 1.1 |
| 1971 | 1.1 |
| 1972 | 1.3 |
| 1972 | 1.5 |
| 1972 | 1.4 |
| 1972 | 1.6 |
| 1972 | 1.7 |
| 1972 | 1.4 |
| 1972 | 1.7 |
| 1972 | 1.7 |
| 1972 | 1.7 |
| 1972 | 2 |
| 1972 | 1.7 |
| 1972 | 1.4 |
| 1972 | 1.4 |
| 1972 | 1.1 |
| 1972 | 1.3 |
| 1972 | 1.6 |
| 1972 | 1.6 |
| 1972 | 1.6 |
| 1972 | 1.6 |
| 1972 | 1.6 |
| 1972 | 1.7 |
| 1972 | 2 |
| 1972 | 2.1 |
| 1972 | 2.4 |
| 1972 | 2.4 |
| 1972 | 2.4 |
| 1972 | 2.2 |
| 1972 | 2.2 |
| 1972 | 2 |
| 1972 | 1.7 |
| 1972 | 1.7 |
| 1972 | 1.5 |
| 1972 | 1.4 |
| 1972 | 1.1 |
| 1972 | 0.8 |
| 1972 | 0.8 |
| 1972 | 1 |
| 1972 | 1.2 |
| 1972 | 1.4 |
| 1973 | 1.7 |
| 1973 | 1.9 |
| 1973 | 2.1 |
| 1973 | 2.2 |
| 1973 | 2.5 |
| 1973 | 2.8 |
| 1973 | 2.6 |
| 1973 | 2.6 |
| 1973 | 2.6 |
| 1973 | 2.3 |
| 1973 | 2.3 |
| 1973 | 2.1 |
| 1973 | 1.9 |
| 1973 | 1.8 |
| 1973 | 1.8 |
| 1973 | 1.5 |
| 1973 | 1.7 |
| 1973 | 1.7 |
| 1973 | 1.7 |
| 1973 | 1.7 |
| 1973 | 1.5 |
| 1973 | 1.7 |
| 1973 | 1.7 |
| 1973 | 1.8 |
| 1973 | 1.8 |
| 1973 | 1.9 |
| 1973 | 1.6 |
| 1973 | 1.6 |
| 1973 | 1.4 |
| 1973 | 1.7 |
| 1973 | 1.9 |
| 1973 | 1.7 |
| 1973 | 1.7 |
| 1973 | 1.9 |
| 1973 | 1.9 |
| 1973 | 1.9 |
| 1973 | 2.2 |
| 1973 | 1.9 |
| 1973 | 1.8 |
| 1973 | 1.8 |
| 1973 | 1.6 |
| 1973 | 1.5 |
| 1974 | 1.7 |
| 1974 | 1.5 |
| 1974 | 1.5 |
| 1974 | 1.7 |
| 1974 | 1.7 |
| 1974 | 2 |
| 1974 | 2.1 |
| 1974 | 2.1 |
| 1974 | 2.3 |
| 1974 | 2.3 |
| 1974 | 2.3 |
| 1974 | 2.2 |
| 1974 | 2 |
| 1974 | 2 |
| 1974 | 2 |
| 1974 | 2 |
| 1974 | 2.2 |
| 1974 | 2.2 |
| 1974 | 1.9 |
| 1974 | 1.9 |
| 1974 | 1.9 |
| 1974 | 1.9 |
| 1974 | 2.1 |
| 1974 | 1.9 |
| 1974 | 1.9 |
| 1974 | 1.9 |
| 1974 | 1.7 |
| 1974 | 1.7 |
| 1974 | 2 |
| 1974 | 2.3 |
| 1974 | 2.3 |
| 1974 | 2.3 |
| 1974 | 2.3 |
| 1974 | 2.5 |
| 1974 | 2.5 |
| 1974 | 2.2 |
| 1974 | 2.2 |
| 1974 | 2 |
| 1974 | 1.7 |
| 1974 | 1.4 |
| 1974 | 1.4 |
| 1974 | 1.7 |
| 1974 | 1.5 |
| 1974 | 1.5 |
| 1974 | 1.5 |
| 1975 | 1.5 |
| 1975 | 1.5 |
| 1975 | 1.7 |
| 1975 | 1.7 |
| 1975 | 2 |
| 1975 | 1.7 |
| 1975 | 1.4 |
| 1975 | 1.3 |
| 1975 | 1 |
| 1975 | 0.8 |
| 1975 | 0.9 |
| 1975 | 1.1 |
| 1975 | 0.8 |
| 1975 | 0.8 |
| 1975 | 0.8 |
| 1975 | 0.8 |
| 1975 | 0.9 |
| 1975 | 1.2 |
| 1975 | 1.3 |
| 1975 | 1.5 |
| 1975 | 1.7 |
| 1975 | 1.4 |
| 1975 | 1.4 |
| 1975 | 1.7 |
| 1975 | 1.7 |
| 1975 | 1.7 |
| 1975 | 1.9 |
| 1975 | 1.9 |
| 1975 | 2.1 |
| 1975 | 1.9 |
| 1975 | 1.6 |
| 1975 | 1.7 |
| 1975 | 2 |
| 1975 | 1.8 |
| 1975 | 1.8 |
| 1975 | 1.8 |
| 1975 | 1.8 |
| 1975 | 1.6 |
| 1975 | 1.6 |
| 1975 | 1.5 |
| 1976 | 1.6 |
| 1976 | 1.5 |
| 1976 | 1.5 |
| 1976 | 1.7 |
| 1976 | 1.7 |
| 1976 | 1.7 |
| 1976 | 1.7 |
| 1976 | 1.6 |
| 1976 | 1.3 |
| 1976 | 1.6 |
| 1976 | 1.8 |
| 1976 | 2.1 |
| 1976 | 2.1 |
| 1976 | 2.1 |
| 1976 | 1.8 |
| 1976 | 2.1 |
| 1976 | 1.8 |
| 1976 | 2.1 |
| 1976 | 2.1 |
| 1976 | 1.9 |
| 1976 | 1.9 |
| 1976 | 1.6 |
| 1976 | 1.3 |
| 1976 | 1.3 |
| 1976 | 1.6 |
| 1976 | 1.3 |
| 1976 | 1.3 |
| 1976 | 1 |
| 1976 | 1.3 |
| 1976 | 1.3 |
| 1976 | 1.1 |
| 1976 | 1.1 |
| 1976 | 1.2 |
| 1976 | 1 |
| 1976 | 1 |
| 1976 | 1.3 |
| 1976 | 1.4 |
| 1976 | 1.5 |
| 1976 | 1.5 |
| 1976 | 1.7 |
| 1976 | 1.6 |
| 1976 | 1.7 |
| 1976 | 1.9 |
| 1976 | 2.1 |
| 1977 | 2.1 |
| 1977 | 1.9 |
| 1977 | 2.1 |
| 1977 | 2.3 |
| 1977 | 2.1 |
| 1977 | 2.1 |
| 1977 | 2.2 |
| 1977 | 2.2 |
| 1977 | 1.9 |
| 1977 | 1.6 |
| 1977 | 1.4 |
| 1977 | 1.6 |
| 1977 | 1.6 |
| 1977 | 1.6 |
| 1977 | 1.8 |
| 1977 | 1.5 |
| 1977 | 1.7 |
| 1977 | 1.6 |
| 1977 | 1.9 |
| 1977 | 2 |
| 1977 | 2.2 |
| 1977 | 2.2 |
| 1977 | 2 |
| 1977 | 2 |
| 1977 | 1.7 |
| 1977 | 1.7 |
| 1977 | 1.7 |
| 1977 | 1.7 |
| 1977 | 1.5 |
| 1977 | 1.4 |
| 1977 | 1.4 |
| 1977 | 1.4 |
| 1977 | 1.4 |
| 1977 | 1.1 |
| 1977 | 1.1 |
| 1977 | 1.2 |
| 1977 | 1.2 |
| 1977 | 1.2 |
| 1977 | 1.4 |
| 1977 | 1.4 |
| 1977 | 1.1 |
| 1977 | 1.1 |
| 1978 | 1.3 |
| 1978 | 1.4 |
| 1978 | 1.5 |
| 1978 | 1.5 |
| 1978 | 1.5 |
| 1978 | 1.8 |
| 1978 | 1.8 |
| 1978 | 1.8 |
| 1978 | 2.1 |
| 1978 | 1.8 |
| 1978 | 1.8 |
| 1978 | 2 |
| 1978 | 2.2 |
| 1978 | 2.4 |
| 1978 | 2.1 |
| 1978 | 2.1 |
| 1978 | 1.9 |
| 1978 | 2 |
| 1978 | 2 |
| 1978 | 2.3 |
| 1978 | 2 |
| 1978 | 2 |
| 1978 | 1.8 |
| 1978 | 1.5 |
| 1978 | 1.8 |
| 1978 | 1.5 |
| 1978 | 1.7 |
| 1978 | 1.9 |
| 1978 | 1.9 |
| 1978 | 1.7 |
| 1978 | 1.7 |
| 1978 | 1.7 |
| 1978 | 1.9 |
| 1978 | 1.9 |
| 1978 | 1.9 |
| 1978 | 2.2 |
| 1978 | 2 |
| 1978 | 1.8 |
| 1978 | 1.6 |
| 1978 | 1.8 |
| 1979 | 1.8 |
| 1979 | 1.6 |
| 1979 | 1.6 |
| 1979 | 1.7 |
| 1979 | 1.5 |
| 1979 | 1.5 |
| 1979 | 1.5 |
| 1979 | 1.7 |
| 1979 | 1.6 |
| 1979 | 1.3 |
| 1979 | 1.4 |
| 1979 | 1.3 |
| 1979 | 1.3 |
| 1979 | 1.3 |
| 1979 | 1.3 |
| 1979 | 1 |
| 1979 | 1 |
| 1979 | 0.7 |
| 1979 | 0.8 |
| 1979 | 1.1 |
| 1979 | 1.1 |
| 1979 | 1.2 |
| 1979 | 1.2 |
| 1979 | 1.2 |
| 1979 | 1.1 |
| 1979 | 1.1 |
| 1979 | 1.3 |
| 1979 | 1.4 |
| 1979 | 1.3 |
| 1979 | 1.1 |
| 1979 | 1 |
| 1979 | 1.2 |
| 1979 | 0.9 |
| 1979 | 1.1 |
| 1979 | 1.4 |
| 1979 | 1.4 |
| 1979 | 1.1 |
| 1979 | 1 |
| 1979 | 1.1 |
| 1979 | 1.3 |
| 1979 | 1.6 |
| 1980 | 1.4 |
| 1980 | 1.4 |
| 1980 | 1.2 |
| 1980 | 1.2 |
| 1980 | 1.3 |
| 1980 | 1.6 |
| 1980 | 1.9 |
| 1980 | 1.9 |
| 1980 | 1.6 |
| 1980 | 1.3 |
| 1980 | 1.5 |
| 1980 | 1.5 |
| 1980 | 1.4 |
| 1980 | 1.2 |
| 1980 | 1.2 |
| 1980 | 1 |
| 1980 | 0.7 |
| 1980 | 0.9 |
| 1980 | 0.9 |
| 1980 | 0.9 |
| 1980 | 0.9 |
| 1980 | 1.2 |
| 1980 | 1.2 |
| 1980 | 1.4 |
| 1980 | 1.6 |
| 1980 | 1.8 |
| 1980 | 1.8 |
| 1980 | 1.8 |
| 1980 | 2.1 |
| 1980 | 2.1 |
| 1980 | 1.8 |
| 1980 | 1.5 |
| 1980 | 1.8 |
| 1980 | 1.5 |
| 1980 | 1.3 |
| 1980 | 1.1 |
| 1980 | 1.1 |
| 1980 | 1.1 |
| 1980 | 0.8 |
| 1981 | 1.1 |
| 1981 | 1.4 |
| 1981 | 1.7 |
| 1981 | 1.5 |
| 1981 | 1.8 |
| 1981 | 2 |
| 1981 | 2 |
| 1981 | 2 |
| 1981 | 2 |
| 1981 | 2.1 |
| 1981 | 2.1 |
| 1981 | 2.1 |
| 1981 | 1.9 |
| 1981 | 2.1 |
| 1981 | 1.8 |
| 1981 | 1.5 |
| 1981 | 1.5 |
| 1981 | 1.8 |
| 1981 | 1.8 |
| 1981 | 1.7 |
| 1981 | 1.7 |
| 1981 | 1.7 |
| 1981 | 1.7 |
| 1981 | 1.4 |
| 1981 | 1.5 |
| 1981 | 1.8 |
| 1981 | 1.8 |
| 1981 | 1.8 |
| 1981 | 1.6 |
| 1981 | 1.9 |
| 1981 | 1.9 |
| 1981 | 1.9 |
| 1981 | 1.9 |
| 1981 | 2.2 |
| 1981 | 2.2 |
| 1981 | 1.9 |
| 1981 | 1.8 |
| 1981 | 1.8 |
| 1981 | 2 |
| 1981 | 2 |
| 1981 | 1.7 |
| 1981 | 1.7 |
| 1981 | 1.7 |
| 1981 | 1.7 |
| 1981 | 1.9 |
| 1982 | 1.9 |
| 1982 | 2.2 |
| 1982 | 1.9 |
| 1982 | 1.7 |
| 1982 | 1.7 |
| 1982 | 1.7 |
| 1982 | 1.5 |
| 1982 | 1.4 |
| 1982 | 1.4 |
| 1982 | 1.2 |
| 1982 | 1.5 |
| 1982 | 1.3 |
| 1982 | 1.4 |
| 1982 | 1.6 |
| 1982 | 1.4 |
| 1982 | 1.7 |
| 1982 | 1.6 |
| 1982 | 1.9 |
| 1982 | 1.9 |
| 1982 | 1.9 |
| 1982 | 1.9 |
| 1982 | 2.1 |
| 1982 | 2.3 |
| 1982 | 2.3 |
| 1982 | 2.3 |
| 1982 | 2.3 |
| 1982 | 2.6 |
| 1982 | 2.4 |
| 1982 | 2.4 |
| 1982 | 2.4 |
| 1982 | 2.4 |
| 1982 | 2.4 |
| 1982 | 2.4 |
| 1982 | 2.2 |
| 1982 | 2.1 |
| 1982 | 2.1 |
| 1982 | 2.1 |
| 1982 | 2.3 |
| 1982 | 2.3 |
| 1983 | 2.5 |
| 1983 | 2.3 |
| 1983 | 2.3 |
| 1983 | 2.3 |
| 1983 | 2.5 |
| 1983 | 2.8 |
| 1983 | 2.8 |
| 1983 | 2.8 |
| 1983 | 2.6 |
| 1983 | 2.6 |
| 1983 | 2.6 |
| 1983 | 2.5 |
| 1983 | 2.5 |
| 1983 | 2.3 |
| 1983 | 2.3 |
| 1983 | 2 |
| 1983 | 2 |
| 1983 | 2 |
| 1983 | 2.2 |
| 1983 | 2.2 |
| 1983 | 2 |
| 1983 | 2.1 |
| 1983 | 2.1 |
| 1983 | 2.3 |
| 1983 | 2.1 |
| 1983 | 2.4 |
| 1983 | 2.4 |
| 1983 | 2.2 |
| 1983 | 1.9 |
| 1983 | 1.9 |
| 1983 | 2.1 |
| 1983 | 2 |
| 1983 | 1.7 |
| 1983 | 1.7 |
| 1983 | 1.9 |
| 1983 | 1.9 |
| 1983 | 1.9 |
| 1983 | 2.1 |
| 1983 | 2.4 |
| 1983 | 2.2 |
| 1983 | 1.9 |
| 1983 | 2.2 |
| 1984 | 2.5 |
| 1984 | 2.5 |
| 1984 | 2.5 |
| 1984 | 2.5 |
| 1984 | 2.2 |
| 1984 | 2.2 |
| 1984 | 2 |
| 1984 | 2.2 |
| 1984 | 2.5 |
| 1984 | 2.3 |
| 1984 | 2.3 |
| 1984 | 2 |
| 1984 | 2 |
| 1984 | 2 |
| 1984 | 2 |
| 1984 | 1.8 |
| 1984 | 2 |
| 1984 | 2 |
| 1984 | 2 |
| 1984 | 2 |
| 1984 | 2 |
| 1984 | 2.3 |
| 1984 | 2.3 |
| 1984 | 2.3 |
| 1984 | 2.6 |
| 1984 | 2.8 |
| 1984 | 2.6 |
| 1984 | 2.6 |
| 1984 | 2.6 |
| 1984 | 2.8 |
| 1984 | 2.6 |
| 1984 | 2.6 |
| 1984 | 2.3 |
| 1984 | 2.3 |
| 1984 | 2.3 |
| 1984 | 2 |
| 1984 | 2 |
| 1984 | 2 |
| 1984 | 2 |
| 1984 | 1.8 |
| 1984 | 2 |
| 1984 | 2 |
| 1984 | 2.3 |
| 1985 | 2.3 |
| 1985 | 2 |
| 1985 | 2.1 |
| 1985 | 2.3 |
| 1985 | 2.3 |
| 1985 | 2.1 |
| 1985 | 2.3 |
| 1985 | 2.3 |
| 1985 | 2.1 |
| 1985 | 2.1 |
| 1985 | 2.1 |
| 1985 | 2.2 |
| 1985 | 2.2 |
| 1985 | 2.2 |
| 1985 | 1.9 |
| 1985 | 1.8 |
| 1985 | 1.8 |
| 1985 | 1.8 |
| 1985 | 1.8 |
| 1985 | 1.8 |
| 1985 | 1.8 |
| 1985 | 1.8 |
| 1985 | 1.8 |
| 1985 | 1.8 |
| 1985 | 2.1 |
| 1985 | 2.4 |
| 1985 | 2.2 |
| 1985 | 2 |
| 1985 | 2.2 |
| 1985 | 2 |
| 1985 | 2 |
| 1985 | 2.2 |
| 1985 | 2.4 |
| 1985 | 2.4 |
| 1985 | 2.4 |
| 1985 | 2.4 |
| 1985 | 2.6 |
| 1985 | 2.6 |
| 1985 | 2.6 |
| 1985 | 2.8 |
| 1985 | 2.8 |
| 1985 | 2.8 |
| 1985 | 2.6 |
| 1985 | 2.6 |
| 1985 | 2.3 |
| 1985 | 2.1 |
| 1985 | 1.8 |
| 1985 | 2 |
| 1985 | 2 |
| 1985 | 2 |
| 1985 | 2 |
| 1986 | 1.8 |
| 1986 | 1.7 |
| 1986 | 1.7 |
| 1986 | 2 |
| 1986 | 1.9 |
| 1986 | 2.2 |
| 1986 | 2 |
| 1986 | 2 |
| 1986 | 2 |
| 1986 | 1.7 |
| 1986 | 1.9 |
| 1986 | 2 |
| 1986 | 2 |
| 1986 | 2 |
| 1986 | 2.3 |
| 1986 | 2 |
| 1986 | 2 |
| 1986 | 2 |
| 1986 | 2 |
| 1986 | 2.1 |
| 1986 | 2.1 |
| 1986 | 2.1 |
| 1986 | 1.9 |
| 1986 | 1.6 |
| 1986 | 1.6 |
| 1986 | 1.9 |
| 1986 | 2.1 |
| 1986 | 2.1 |
| 1986 | 2.1 |
| 1986 | 2.1 |
| 1986 | 1.9 |
| 1986 | 2.1 |
| 1986 | 2.1 |
| 1986 | 2.4 |
| 1986 | 2.4 |
| 1986 | 2.4 |
| 1986 | 2.2 |
| 1986 | 2.2 |
| 1986 | 2.2 |
| 1986 | 2.1 |
| 1986 | 2.1 |
| 1986 | 2.1 |
| 1986 | 2 |
| 1986 | 1.7 |
| 1986 | 1.4 |
| 1986 | 1.2 |
| 1986 | 1.4 |
| 1986 | 1.4 |
| 1987 | 1.1 |
| 1987 | 1.4 |
| 1987 | 1.6 |
| 1987 | 1.6 |
| 1987 | 1.9 |
| 1987 | 2.2 |
| 1987 | 2.2 |
| 1987 | 2.4 |
| 1987 | 2.4 |
| 1987 | 2.2 |
| 1987 | 2.3 |
| 1987 | 2.3 |
| 1987 | 2.3 |
| 1987 | 2.3 |
| 1987 | 2.3 |
| 1987 | 2.3 |
| 1987 | 2.6 |
| 1987 | 2.4 |
| 1987 | 2.4 |
| 1987 | 2.6 |
| 1987 | 2.8 |
| 1987 | 2.8 |
| 1987 | 2.8 |
| 1987 | 2.8 |
| 1987 | 2.8 |
| 1987 | 2.8 |
| 1987 | 2.8 |
| 1987 | 3 |
| 1987 | 3 |
| 1987 | 3 |
| 1987 | 2.8 |
| 1987 | 2.8 |
| 1987 | 2.8 |
| 1987 | 2.8 |
| 1987 | 2.6 |
| 1987 | 2.4 |
| 1987 | 2.4 |
| 1987 | 2.4 |
| 1987 | 2.4 |
| 1987 | 2.4 |
| 1987 | 2.3 |
| 1987 | 2.3 |
| 1987 | 2.3 |
| 1987 | 2 |
| 1987 | 2 |
| 1987 | 2 |
| 1987 | 1.8 |
| 1987 | 1.5 |
| 1988 | 1.3 |
| 1988 | 1.1 |
| 1988 | 1.2 |
| 1988 | 1.2 |
| 1988 | 0.9 |
| 1988 | 1.2 |
| 1988 | 1.2 |
| 1988 | 1.4 |
| 1988 | 1.3 |
| 1988 | 1.6 |
| 1988 | 1.8 |
| 1988 | 1.7 |
| 1988 | 1.9 |
| 1988 | 1.6 |
| 1988 | 1.9 |
| 1988 | 1.9 |
| 1988 | 2.1 |
| 1988 | 1.8 |
| 1988 | 2.1 |
| 1988 | 1.9 |
| 1988 | 1.9 |
| 1988 | 1.9 |
| 1988 | 1.9 |
| 1988 | 2 |
| 1988 | 2 |
| 1988 | 1.7 |
| 1988 | 1.4 |
| 1988 | 1.7 |
| 1988 | 1.5 |
| 1988 | 1.4 |
| 1988 | 1.2 |
| 1988 | 1.5 |
| 1988 | 1.2 |
| 1988 | 1.4 |
| 1988 | 1.1 |
| 1988 | 1.4 |
| 1988 | 1.7 |
| 1988 | 1.7 |
| 1988 | 1.6 |
| 1988 | 1.9 |
| 1988 | 2.1 |
| 1988 | 1.8 |
| 1988 | 2.1 |
| 1989 | 2.1 |
| 1989 | 2.4 |
| 1989 | 2.2 |
| 1989 | 2 |
| 1989 | 1.7 |
| 1989 | 1.7 |
| 1989 | 1.4 |
| 1989 | 1.4 |
| 1989 | 1.5 |
| 1989 | 1.5 |
| 1989 | 1.5 |
| 1989 | 1.5 |
| 1989 | 1.4 |
| 1989 | 1.3 |
| 1989 | 1.6 |
| 1989 | 1.9 |
| 1989 | 1.9 |
| 1989 | 1.6 |
| 1989 | 1.8 |
| 1989 | 1.6 |
| 1989 | 1.6 |
| 1989 | 1.6 |
| 1989 | 1.7 |
| 1989 | 2 |
| 1989 | 1.8 |
| 1989 | 1.5 |
| 1989 | 1.8 |
| 1989 | 2.1 |
| 1989 | 1.9 |
| 1989 | 2.1 |
| 1989 | 1.8 |
| 1989 | 1.8 |
| 1989 | 1.8 |
| 1989 | 1.8 |
| 1989 | 2 |
| 1989 | 2 |
| 1989 | 2 |
| 1989 | 2 |
| 1989 | 1.9 |
| 1989 | 1.9 |
| 1989 | 2.2 |
| 1989 | 2 |
| 1989 | 2.2 |
| 1989 | 1.9 |
| 1989 | 1.9 |
| 1990 | 2.2 |
| 1990 | 2.2 |
| 1990 | 2 |
| 1990 | 2.3 |
| 1990 | 2 |
| 1990 | 1.7 |
| 1990 | 1.9 |
| 1990 | 1.9 |
| 1990 | 2 |
| 1990 | 1.7 |
| 1990 | 1.7 |
| 1990 | 1.7 |
| 1990 | 1.9 |
| 1990 | 1.7 |
| 1990 | 2 |
| 1990 | 2.1 |
| 1990 | 1.8 |
| 1990 | 1.5 |
| 1990 | 1.7 |
| 1990 | 2 |
| 1990 | 1.8 |
| 1990 | 1.6 |
| 1990 | 1.4 |
| 1990 | 1.6 |
| 1990 | 1.3 |
| 1990 | 1.2 |
| 1990 | 1.5 |
| 1990 | 1.8 |
| 1990 | 1.8 |
| 1990 | 1.8 |
| 1990 | 2 |
| 1990 | 2.2 |
| 1990 | 2.4 |
| 1990 | 2.4 |
| 1990 | 2.4 |
| 1990 | 2.7 |
| 1990 | 2.4 |
| 1990 | 2.4 |
| 1990 | 2.4 |
| 1990 | 2.1 |
| 1990 | 1.8 |
| 1990 | 1.5 |
| 1990 | 1.5 |
| 1990 | 1.5 |
| 1991 | 1.5 |
| 1991 | 1.3 |
| 1991 | 1.3 |
| 1991 | 1 |
| 1991 | 1 |
| 1991 | 1.3 |
| 1991 | 1.6 |
| 1991 | 1.9 |
| 1991 | 1.9 |
| 1991 | 1.7 |
| 1991 | 1.7 |
| 1991 | 1.9 |
| 1991 | 2.2 |
| 1991 | 2.5 |
| 1991 | 2.2 |
| 1991 | 1.9 |
| 1991 | 1.6 |
| 1991 | 1.3 |
| 1991 | 1.3 |
| 1991 | 1.5 |
| 1991 | 1.6 |
| 1991 | 1.6 |
| 1991 | 1.6 |
| 1991 | 1.6 |
| 1991 | 1.7 |
| 1991 | 1.7 |
| 1991 | 1.7 |
| 1991 | 1.7 |
| 1991 | 1.4 |
| 1991 | 1.4 |
| 1991 | 1.6 |
| 1991 | 1.4 |
| 1991 | 1.2 |
| 1991 | 0.9 |
| 1991 | 1.1 |
| 1991 | 1.4 |
| 1991 | 1.5 |
| 1991 | 1.8 |
| 1991 | 1.9 |
| 1991 | 1.9 |
| 1991 | 1.7 |
| 1991 | 1.9 |
| 1992 | 1.8 |
| 1992 | 2.1 |
| 1992 | 2.1 |
| 1992 | 1.8 |
| 1992 | 2 |
| 1992 | 1.7 |
| 1992 | 1.9 |
| 1992 | 1.7 |
| 1992 | 1.6 |
| 1992 | 1.6 |
| 1992 | 1.6 |
| 1992 | 1.4 |
| 1992 | 1.1 |
| 1992 | 1.4 |
| 1992 | 1.1 |
| 1992 | 1.2 |
| 1992 | 1.2 |
| 1992 | 1.1 |
| 1992 | 1.4 |
| 1992 | 1.4 |
| 1992 | 1.4 |
| 1992 | 1.3 |
| 1992 | 1.3 |
| 1992 | 1.1 |
| 1992 | 1.1 |
| 1992 | 1.3 |
| 1992 | 1.1 |
| 1992 | 1.4 |
| 1992 | 1.2 |
| 1992 | 1 |
| 1992 | 1.3 |
| 1992 | 1.4 |
| 1992 | 1.7 |
| 1992 | 1.6 |
| 1992 | 1.6 |
| 1992 | 1.3 |
| 1992 | 1.5 |
| 1992 | 1.5 |
| 1992 | 1.7 |
| 1992 | 1.9 |
| 1992 | 1.7 |
| 1992 | 1.9 |
| 1992 | 1.7 |
| 1992 | 2 |
| 1992 | 2.1 |
| 1992 | 2.4 |
| 1993 | 2.4 |
| 1993 | 2.2 |
| 1993 | 1.9 |
| 1993 | 1.9 |
| 1993 | 2.1 |
| 1993 | 2.1 |
| 1993 | 2 |
| 1993 | 1.7 |
| 1993 | 1.6 |
| 1993 | 1.6 |
| 1993 | 1.3 |
| 1993 | 1.5 |
| 1993 | 1.8 |
| 1993 | 1.8 |
| 1993 | 1.8 |
| 1993 | 1.8 |
| 1993 | 1.9 |
| 1993 | 1.9 |
| 1993 | 1.9 |
| 1993 | 1.6 |
| 1993 | 1.9 |
| 1993 | 1.7 |
| 1993 | 1.4 |
| 1993 | 1.2 |
| 1993 | 1.2 |
| 1993 | 0.9 |
| 1993 | 0.9 |
| 1993 | 0.9 |
| 1993 | 0.9 |
| 1993 | 1.2 |
| 1993 | 1.2 |
| 1993 | 1.4 |
| 1993 | 1.7 |
| 1993 | 1.6 |
| 1993 | 1.6 |
| 1993 | 1.7 |
| 1993 | 1.7 |
| 1993 | 1.7 |
| 1993 | 1.7 |
| 1993 | 1.7 |
| 1993 | 1.5 |
| 1994 | 1.5 |
| 1994 | 1.3 |
| 1994 | 1.4 |
| 1994 | 1.4 |
| 1994 | 1.3 |
| 1994 | 1.2 |
| 1994 | 1.5 |
| 1994 | 1.5 |
| 1994 | 1.3 |
| 1994 | 1.2 |
| 1994 | 1.2 |
| 1994 | 1.4 |
| 1994 | 1.3 |
| 1994 | 1 |
| 1994 | 1.1 |
| 1994 | 1.2 |
| 1994 | 1.2 |
| 1994 | 1.3 |
| 1994 | 1.2 |
| 1994 | 1.3 |
| 1994 | 1.1 |
| 1994 | 1.1 |
| 1994 | 1.4 |
| 1994 | 1.7 |
| 1994 | 1.9 |
| 1994 | 2.1 |
| 1994 | 1.8 |
| 1994 | 1.7 |
| 1994 | 1.7 |
| 1994 | 1.7 |
| 1994 | 1.7 |
| 1994 | 1.7 |
| 1994 | 1.7 |
| 1994 | 1.7 |
| 1994 | 1.7 |
| 1994 | 1.7 |
| 1994 | 1.7 |
| 1995 | 2 |
| 1995 | 2 |
| 1995 | 1.9 |
| 1995 | 2.1 |
| 1995 | 1.9 |
| 1995 | 1.9 |
| 1995 | 1.9 |
| 1995 | 1.9 |
| 1995 | 1.9 |
| 1995 | 2.2 |
| 1995 | 2.2 |
| 1995 | 2.5 |
| 1995 | 2.8 |
| 1995 | 2.8 |
| 1995 | 2.8 |
| 1995 | 2.8 |
| 1995 | 2.8 |
| 1995 | 2.5 |
| 1995 | 2.2 |
| 1995 | 2.2 |
| 1995 | 2.2 |
| 1995 | 2 |
| 1995 | 1.7 |
| 1995 | 1.4 |
| 1995 | 1.6 |
| 1995 | 1.6 |
| 1995 | 1.6 |
| 1995 | 1.9 |
| 1995 | 2 |
| 1995 | 2 |
| 1995 | 2 |
| 1995 | 2 |
| 1995 | 2.3 |
| 1995 | 2.6 |
| 1995 | 2.4 |
| 1995 | 2.1 |
| 1995 | 2.1 |
| 1995 | 2.1 |
| 1995 | 2 |
| 1995 | 1.7 |
| 1995 | 1.7 |
| 1995 | 1.9 |
| 1995 | 1.9 |
| 1995 | 1.9 |
| 1995 | 1.9 |
| 1995 | 1.9 |
| 1995 | 1.6 |
| 1996 | 1.6 |
| 1996 | 1.9 |
| 1996 | 2.2 |
| 1996 | 2.2 |
| 1996 | 2 |
| 1996 | 2 |
| 1996 | 2 |
| 1996 | 2 |
| 1996 | 2.1 |
| 1996 | 2.1 |
| 1996 | 1.8 |
| 1996 | 1.8 |
| 1996 | 1.8 |
| 1996 | 1.8 |
| 1996 | 1.7 |
| 1996 | 1.5 |
| 1996 | 1.2 |
| 1996 | 1.4 |
| 1996 | 1.6 |
| 1996 | 1.9 |
| 1996 | 2 |
| 1996 | 2 |
| 1996 | 2 |
| 1996 | 1.8 |
| 1996 | 1.8 |
| 1996 | 1.8 |
| 1996 | 2.1 |
| 1996 | 1.9 |
| 1996 | 1.7 |
| 1996 | 1.7 |
| 1996 | 1.7 |
| 1996 | 1.5 |
| 1996 | 1.5 |
| 1996 | 1.5 |
| 1996 | 1.8 |
| 1996 | 2 |
| 1996 | 2 |
| 1996 | 1.9 |
| 1996 | 1.8 |
| 1996 | 1.8 |
| 1996 | 1.7 |
| 1996 | 1.7 |
| 1996 | 1.7 |
| 1996 | 1.9 |
| 1996 | 1.9 |
| 1996 | 1.6 |
| 1996 | 1.6 |
| 1996 | 1.9 |
| 1996 | 1.9 |
| 1996 | 1.7 |
| 1996 | 1.7 |
| 1997 | 1.9 |
| 1997 | 1.9 |
| 1997 | 1.6 |
| 1997 | 1.4 |
| 1997 | 1.4 |
| 1997 | 1.4 |
| 1997 | 1.1 |
| 1997 | 1.4 |
| 1997 | 1.6 |
| 1997 | 1.7 |
| 1997 | 1.7 |
| 1997 | 1.5 |
| 1997 | 1.8 |
| 1997 | 1.8 |
| 1997 | 1.9 |
| 1997 | 1.6 |
| 1997 | 1.6 |
| 1997 | 1.6 |
| 1997 | 1.4 |
| 1997 | 1.4 |
| 1997 | 1.4 |
| 1997 | 1.3 |
| 1997 | 1.1 |
| 1997 | 1 |
| 1997 | 1.2 |
| 1997 | 1.5 |
| 1997 | 1.8 |
| 1997 | 1.5 |
| 1997 | 1.4 |
| 1997 | 1.3 |
| 1997 | 1.3 |
| 1997 | 1.6 |
| 1997 | 1.8 |
| 1997 | 2.1 |
| 1997 | 2.1 |
| 1997 | 1.9 |
| 1997 | 1.6 |
| 1997 | 1.6 |
| 1997 | 1.9 |
| 1997 | 2.2 |
| 1997 | 2.2 |
| 1997 | 1.9 |
| 1997 | 1.7 |
| 1997 | 1.7 |
| 1997 | 1.7 |
| 1997 | 1.6 |
| 1997 | 1.9 |
| 1997 | 2.2 |
| 1997 | 1.9 |
| 1998 | 1.6 |
| 1998 | 1.4 |
| 1998 | 1.4 |
| 1998 | 1.4 |
| 1998 | 1.2 |
| 1998 | 0.9 |
| 1998 | 1.2 |
| 1998 | 0.9 |
| 1998 | 0.9 |
| 1998 | 1.2 |
| 1998 | 1.5 |
| 1998 | 1.4 |
| 1998 | 1.5 |
| 1998 | 1.7 |
| 1998 | 1.9 |
| 1998 | 2.2 |
| 1998 | 2 |
| 1998 | 2.3 |
| 1998 | 2.3 |
| 1998 | 2 |
| 1998 | 2 |
| 1998 | 2.3 |
| 1998 | 2.5 |
| 1998 | 2.5 |
| 1998 | 2.5 |
| 1998 | 2.5 |
| 1998 | 2.5 |
| 1998 | 2.3 |
| 1998 | 2 |
| 1998 | 2.3 |
| 1998 | 2 |
| 1998 | 1.8 |
| 1998 | 1.5 |
| 1998 | 1.5 |
| 1998 | 1.3 |
| 1998 | 1.3 |
| 1998 | 1.5 |
| 1998 | 1.7 |
| 1998 | 1.7 |
| 1998 | 1.7 |
| 1998 | 2 |
| 1998 | 2.2 |
| 1998 | 2.5 |
| 1999 | 2.3 |
| 1999 | 2.5 |
| 1999 | 2.3 |
| 1999 | 2.3 |
| 1999 | 2.1 |
| 1999 | 2.2 |
| 1999 | 2.2 |
| 1999 | 2 |
| 1999 | 2 |
| 1999 | 2 |
| 1999 | 2.2 |
| 1999 | 2 |
| 1999 | 1.9 |
| 1999 | 1.6 |
| 1999 | 1.6 |
| 1999 | 1.6 |
| 1999 | 1.6 |
| 1999 | 1.6 |
| 1999 | 1.3 |
| 1999 | 1.3 |
| 1999 | 1.3 |
| 1999 | 1.3 |
| 1999 | 1.6 |
| 1999 | 1.9 |
| 1999 | 2.1 |
| 1999 | 2.3 |
| 1999 | 2.3 |
| 1999 | 2.2 |
| 1999 | 2.5 |
| 1999 | 2.5 |
| 1999 | 2.2 |
| 1999 | 2.1 |
| 1999 | 1.8 |
| 1999 | 1.5 |
| 1999 | 1.3 |
| 1999 | 1.1 |
| 1999 | 0.8 |
| 1999 | 1.1 |
| 1999 | 0.8 |
| 1999 | 0.8 |
| 1999 | 1.1 |
| 1999 | 1.1 |
| 1999 | 1.4 |
| 1999 | 1.5 |
| 1999 | 1.4 |
| 1999 | 1.6 |
| 1999 | 1.6 |
| 2000 | 1.6 |
| 2000 | 1.9 |
| 2000 | 1.9 |
| 2000 | 1.7 |
| 2000 | 2 |
| 2000 | 2 |
| 2000 | 2.2 |
| 2000 | 2.5 |
| 2000 | 2.2 |
| 2000 | 2.2 |
| 2000 | 1.9 |
| 2000 | 1.9 |
| 2000 | 1.7 |
| 2000 | 1.6 |
| 2000 | 1.6 |
| 2000 | 1.6 |
| 2000 | 1.6 |
| 2000 | 1.4 |
| 2000 | 1.5 |
| 2000 | 1.8 |
| 2000 | 2.1 |
| 2000 | 1.9 |
| 2000 | 2.1 |
| 2000 | 2.4 |
| 2000 | 2.4 |
| 2000 | 2.1 |
| 2000 | 2.1 |
| 2000 | 2.3 |
| 2000 | 2.3 |
| 2000 | 2.1 |
| 2000 | 1.8 |
| 2000 | 2 |
| 2000 | 1.7 |
| 2000 | 1.4 |
| 2000 | 1.4 |
| 2000 | 1.4 |
| 2000 | 1.1 |
| 2000 | 1.1 |
| 2000 | 1.1 |
| 2000 | 1.1 |
| 2000 | 1.4 |
| 2000 | 1.4 |
| 2001 | 1.4 |
| 2001 | 1.4 |
| 2001 | 1.4 |
| 2001 | 1.5 |
| 2001 | 1.6 |
| 2001 | 1.6 |
| 2001 | 1.5 |
| 2001 | 1.7 |
| 2001 | 1.5 |
| 2001 | 1.5 |
| 2001 | 1.6 |
| 2001 | 1.9 |
| 2001 | 1.6 |
| 2001 | 1.8 |
| 2001 | 1.7 |
| 2001 | 1.7 |
| 2001 | 1.8 |
| 2001 | 1.6 |
| 2001 | 1.8 |
| 2001 | 1.6 |
| 2001 | 1.5 |
| 2001 | 1.5 |
| 2001 | 1.8 |
| 2001 | 1.5 |
| 2001 | 1.8 |
| 2001 | 1.5 |
| 2001 | 1.4 |
| 2001 | 1.6 |
| 2001 | 1.4 |
| 2001 | 1.3 |
| 2001 | 1.4 |
| 2001 | 1.1 |
| 2001 | 1.1 |
| 2001 | 1.4 |
| 2001 | 1.1 |
| 2001 | 1.1 |
| 2001 | 1.4 |
| 2001 | 1.1 |
| 2001 | 1 |
| 2001 | 1.1 |
| 2001 | 1 |
| 2001 | 1 |
| 2001 | 0.8 |
| 2001 | 0.6 |
| 2001 | 0.6 |
| 2002 | 0.9 |
| 2002 | 0.9 |
| 2002 | 1 |
| 2002 | 1.3 |
| 2002 | 1.2 |
| 2002 | 1.2 |
| 2002 | 1.3 |
| 2002 | 1.3 |
| 2002 | 1.2 |
| 2002 | 1.5 |
| 2002 | 1.2 |
| 2002 | 1 |
| 2002 | 0.9 |
| 2002 | 0.9 |
| 2002 | 1 |
| 2002 | 1.3 |
| 2002 | 1.5 |
| 2002 | 1.4 |
| 2002 | 1.7 |
| 2002 | 1.7 |
| 2002 | 1.8 |
| 2002 | 1.8 |
| 2002 | 2.1 |
| 2002 | 2.1 |
| 2002 | 2.1 |
| 2002 | 1.9 |
| 2002 | 1.6 |
| 2002 | 1.6 |
| 2002 | 1.3 |
| 2002 | 1.1 |
| 2002 | 1.3 |
| 2002 | 1.2 |
| 2002 | 0.9 |
| 2002 | 0.6 |
| 2002 | 0.8 |
| 2002 | 0.7 |
| 2002 | 1 |
| 2002 | 1.1 |
| 2002 | 1.4 |
| 2003 | 1.4 |
| 2003 | 1.2 |
| 2003 | 1.2 |
| 2003 | 1.3 |
| 2003 | 1.6 |
| 2003 | 1.3 |
| 2003 | 1.3 |
| 2003 | 1 |
| 2003 | 1 |
| 2003 | 0.8 |
| 2003 | 1 |
| 2003 | 1.2 |
| 2003 | 1.3 |
| 2003 | 1.5 |
| 2003 | 1.5 |
| 2003 | 1.8 |
| 2003 | 2.1 |
| 2003 | 2.4 |
| 2003 | 2.6 |
| 2003 | 2.6 |
| 2003 | 2.6 |
| 2003 | 2.6 |
| 2003 | 2.6 |
| 2003 | 2.6 |
| 2003 | 2.6 |
| 2003 | 2.3 |
| 2003 | 2.3 |
| 2003 | 2.3 |
| 2003 | 2.3 |
| 2003 | 2.2 |
| 2003 | 2.2 |
| 2003 | 1.9 |
| 2003 | 2.1 |
| 2003 | 1.8 |
| 2003 | 1.6 |
| 2003 | 1.7 |
| 2003 | 1.5 |
| 2004 | 1.3 |
| 2004 | 1.1 |
| 2004 | 1.2 |
| 2004 | 0.9 |
| 2004 | 1.2 |
| 2004 | 0.9 |
| 2004 | 0.9 |
| 2004 | 1.1 |
| 2004 | 1.3 |
| 2004 | 1.5 |
| 2004 | 1.5 |
| 2004 | 1.4 |
| 2004 | 1.6 |
| 2004 | 1.6 |
| 2004 | 1.6 |
| 2004 | 1.6 |
| 2004 | 1.6 |
| 2004 | 1.3 |
| 2004 | 1.3 |
| 2004 | 1.3 |
| 2004 | 1.3 |
| 2004 | 1.4 |
| 2004 | 1.1 |
| 2004 | 1.4 |
| 2004 | 1.4 |
| 2004 | 1.7 |
| 2004 | 1.7 |
| 2004 | 2 |
| 2004 | 1.7 |
| 2004 | 1.7 |
| 2004 | 1.7 |
| 2004 | 1.7 |
| 2004 | 2 |
| 2004 | 2 |
| 2004 | 1.8 |
| 2004 | 1.8 |
| 2004 | 2.1 |
| 2004 | 1.9 |
| 2004 | 2.2 |
| 2004 | 1.9 |
| 2004 | 2.1 |
| 2004 | 2.1 |
| 2004 | 1.9 |
| 2005 | 1.6 |
| 2005 | 1.8 |
| 2005 | 1.8 |
| 2005 | 1.5 |
| 2005 | 1.7 |
| 2005 | 1.7 |
| 2005 | 2 |
| 2005 | 1.8 |
| 2005 | 2 |
| 2005 | 2.2 |
| 2005 | 2.5 |
| 2005 | 2.5 |
| 2005 | 2.5 |
| 2005 | 2.8 |
| 2005 | 2.8 |
| 2005 | 2.5 |
| 2005 | 2.2 |
| 2005 | 2.1 |
| 2005 | 1.8 |
| 2005 | 1.5 |
| 2005 | 1.5 |
| 2005 | 1.5 |
| 2005 | 1.5 |
| 2005 | 1.5 |
| 2005 | 1.5 |
| 2005 | 1.8 |
| 2005 | 1.9 |
| 2005 | 2 |
| 2005 | 2 |
| 2005 | 2.3 |
| 2005 | 2.1 |
| 2005 | 1.9 |
| 2005 | 1.6 |
| 2005 | 1.3 |
| 2005 | 1.1 |
| 2005 | 1.1 |
| 2005 | 1 |
| 2005 | 0.9 |
| 2005 | 0.9 |
| 2005 | 0.6 |
| 2005 | 0.8 |
| 2005 | 1 |
| 2005 | 1.1 |
| 2005 | 1.1 |
| 2005 | 1.1 |
| 2005 | 1.1 |
| 2005 | 1.1 |
| 2005 | 1.2 |
| 2005 | 1.5 |
| 2005 | 1.5 |
| 2005 | 1.2 |
| 2006 | 1.2 |
| 2006 | 1.1 |
| 2006 | 1.1 |
| 2006 | 1.3 |
| 2006 | 1.1 |
| 2006 | 1.1 |
| 2006 | 1 |
| 2006 | 0.8 |
| 2006 | 0.8 |
| 2006 | 1.1 |
| 2006 | 0.8 |
| 2006 | 0.8 |
| 2006 | 0.8 |
| 2006 | 0.8 |
| 2006 | 0.8 |
| 2006 | 1.1 |
| 2006 | 1.1 |
| 2006 | 1.3 |
| 2006 | 1.3 |
| 2006 | 1.3 |
| 2006 | 1.4 |
| 2006 | 1.4 |
| 2006 | 1.4 |
| 2006 | 1.2 |
| 2006 | 1.1 |
| 2006 | 0.9 |
| 2006 | 1 |
| 2006 | 1 |
| 2006 | 1 |
| 2006 | 0.8 |
| 2006 | 0.7 |
| 2006 | 0.8 |
| 2006 | 0.9 |
| 2006 | 0.9 |
| 2006 | 0.9 |
| 2006 | 0.8 |
| 2006 | 1 |
| 2006 | 1 |
| 2007 | 1.3 |
| 2007 | 1.2 |
| 2007 | 1.5 |
| 2007 | 1.7 |
| 2007 | 1.7 |
| 2007 | 1.9 |
| 2007 | 2.2 |
| 2007 | 2.3 |
| 2007 | 2 |
| 2007 | 2 |
| 2007 | 1.7 |
| 2007 | 2 |
| 2007 | 2 |
| 2007 | 2 |
| 2007 | 1.9 |
| 2007 | 1.9 |
| 2007 | 1.9 |
| 2007 | 1.8 |
| 2007 | 2.1 |
| 2007 | 1.8 |
| 2007 | 1.9 |
| 2007 | 1.9 |
| 2007 | 1.7 |
| 2007 | 1.7 |
| 2007 | 1.7 |
| 2007 | 1.7 |
| 2007 | 1.7 |
| 2007 | 2 |
| 2007 | 2 |
| 2007 | 2 |
| 2007 | 1.9 |
| 2007 | 1.7 |
| 2007 | 1.7 |
| 2007 | 1.7 |
| 2007 | 1.7 |
| 2007 | 1.4 |
| 2007 | 1.4 |
| 2007 | 1.2 |
| 2007 | 1 |
| 2007 | 1 |
| 2007 | 1.3 |
| 2007 | 1.5 |
| 2007 | 1.5 |
| 2007 | 1.2 |
| 2007 | 1.3 |
| 2007 | 1.6 |
| 2008 | 1.6 |
| 2008 | 1.5 |
| 2008 | 1.7 |
| 2008 | 2 |
| 2008 | 2 |
| 2008 | 1.7 |
| 2008 | 1.9 |
| 2008 | 2.2 |
| 2008 | 2.4 |
| 2008 | 2.4 |
| 2008 | 2.4 |
| 2008 | 2.7 |
| 2008 | 2.7 |
| 2008 | 2.4 |
| 2008 | 2.2 |
| 2008 | 2.5 |
| 2008 | 2.5 |
| 2008 | 2.2 |
| 2008 | 2.2 |
| 2008 | 2.2 |
| 2008 | 2.2 |
| 2008 | 2.2 |
| 2008 | 2.2 |
| 2008 | 2.5 |
| 2008 | 2.7 |
| 2008 | 2.5 |
| 2008 | 2.2 |
| 2008 | 2.5 |
| 2008 | 2.2 |
| 2008 | 2.2 |
| 2008 | 1.9 |
| 2008 | 1.9 |
| 2008 | 1.7 |
| 2008 | 1.7 |
| 2008 | 1.4 |
| 2008 | 1.6 |
| 2008 | 1.7 |
| 2008 | 1.7 |
| 2008 | 1.8 |
| 2008 | 1.6 |
| 2009 | 1.6 |
| 2009 | 1.6 |
| 2009 | 1.8 |
| 2009 | 1.8 |
| 2009 | 2.1 |
| 2009 | 2.1 |
| 2009 | 2 |
| 2009 | 1.8 |
| 2009 | 2 |
| 2009 | 2.2 |
| 2009 | 2.5 |
| 2009 | 2.2 |
| 2009 | 1.9 |
| 2009 | 1.9 |
| 2009 | 1.9 |
| 2009 | 1.9 |
| 2009 | 1.9 |
| 2009 | 2.1 |
| 2009 | 2.1 |
| 2009 | 1.9 |
| 2009 | 1.7 |
| 2009 | 2 |
| 2009 | 2.3 |
| 2009 | 2.3 |
| 2009 | 2 |
| 2009 | 1.8 |
| 2009 | 1.9 |
| 2009 | 1.9 |
| 2009 | 1.9 |
| 2009 | 2.1 |
| 2009 | 2.3 |
| 2009 | 2.1 |
| 2009 | 2.1 |
| 2009 | 1.8 |
| 2009 | 1.8 |
| 2009 | 2 |
| 2009 | 2.2 |
| 2009 | 2.2 |
| 2009 | 1.9 |
| 2009 | 1.7 |
| 2009 | 1.7 |
| 2009 | 1.9 |
| 2009 | 1.7 |
| 2009 | 1.7 |
| 2009 | 2 |
| 2009 | 2 |
| 2009 | 1.8 |
| 2010 | 1.5 |
| 2010 | 1.6 |
| 2010 | 1.5 |
| 2010 | 1.3 |
| 2010 | 1.3 |
| 2010 | 1.5 |
| 2010 | 1.6 |
| 2010 | 1.6 |
| 2010 | 1.6 |
| 2010 | 1.5 |
| 2010 | 1.8 |
| 2010 | 2 |
| 2010 | 2.1 |
| 2010 | 2.3 |
| 2010 | 2.1 |
| 2010 | 2.1 |
| 2010 | 2 |
| 2010 | 2 |
| 2010 | 2 |
| 2010 | 2.3 |
| 2010 | 2 |
| 2010 | 2 |
| 2010 | 1.9 |
| 2010 | 1.7 |
| 2010 | 1.9 |
| 2010 | 1.9 |
| 2010 | 2.2 |
| 2010 | 2.2 |
| 2010 | 2 |
| 2010 | 2 |
| 2010 | 2.3 |
| 2010 | 2 |
| 2010 | 2 |
| 2010 | 1.9 |
| 2010 | 1.9 |
| 2010 | 1.6 |
| 2010 | 1.6 |
| 2010 | 1.3 |
| 2010 | 1.3 |
| 2010 | 1.1 |
| 2010 | 1.1 |
| 2010 | 1.2 |
| 2010 | 1.3 |
| 2010 | 1.3 |
| 2010 | 1.3 |
| 2010 | 1.6 |
| 2010 | 1.4 |
| 2010 | 1.7 |
| 2010 | 1.9 |
| 2010 | 1.8 |
| 2010 | 1.8 |
| 2010 | 1.8 |
| 2010 | 1.7 |
| 2011 | 1.7 |
| 2011 | 1.5 |
| 2011 | 1.5 |
| 2011 | 1.4 |
| 2011 | 1.4 |
| 2011 | 1.4 |
| 2011 | 1.5 |
| 2011 | 1.3 |
| 2011 | 1.2 |
| 2011 | 1.5 |
| 2011 | 1.8 |
| 2011 | 2 |
| 2011 | 1.7 |
| 2011 | 1.7 |
| 2011 | 1.5 |
| 2011 | 1.3 |
| 2011 | 1.2 |
| 2011 | 1.1 |
| 2011 | 1.4 |
| 2011 | 1.4 |
| 2011 | 1.4 |
| 2011 | 1.2 |
| 2011 | 1.5 |
| 2011 | 1.5 |
| 2011 | 1.4 |
| 2011 | 1.4 |
| 2011 | 1.5 |
| 2011 | 1.8 |
| 2011 | 1.8 |
| 2011 | 1.8 |
| 2011 | 1.5 |
| 2011 | 1.5 |
| 2011 | 1.3 |
| 2011 | 1.3 |
| 2011 | 1.6 |
| 2011 | 1.6 |
| 2011 | 1.8 |
| 2011 | 1.8 |
| 2011 | 1.6 |
| 2011 | 1.4 |
| 2011 | 1.7 |
| 2012 | 1.7 |
| 2012 | 1.7 |
| 2012 | 1.8 |
| 2012 | 1.8 |
| 2012 | 1.7 |
| 2012 | 1.5 |
| 2012 | 1.5 |
| 2012 | 1.4 |
| 2012 | 1.6 |
| 2012 | 1.6 |
| 2012 | 1.6 |
| 2012 | 1.6 |
| 2012 | 1.8 |
| 2012 | 1.5 |
| 2012 | 1.8 |
| 2012 | 2 |
| 2012 | 2 |
| 2012 | 2.3 |
| 2012 | 2.3 |
| 2012 | 2.3 |
| 2012 | 2.2 |
| 2012 | 2.1 |
| 2012 | 2.1 |
| 2012 | 2.4 |
| 2012 | 2.4 |
| 2012 | 2.1 |
| 2012 | 1.8 |
| 2012 | 1.8 |
| 2012 | 1.8 |
| 2012 | 1.6 |
| 2012 | 1.6 |
| 2012 | 1.9 |
| 2012 | 1.9 |
| 2012 | 1.9 |
| 2012 | 1.6 |
| 2012 | 1.7 |
| 2012 | 1.7 |
| 2012 | 1.4 |
| 2012 | 1.4 |
| 2012 | 1.6 |
| 2012 | 1.6 |
| 2012 | 1.3 |
| 2012 | 1 |
| 2012 | 1 |
| 2012 | 1 |
| 2012 | 1.2 |
| 2012 | 1.5 |
| 2012 | 1.8 |
| 2012 | 1.8 |
| 2012 | 1.5 |
| 2013 | 1.5 |
| 2013 | 1.6 |
| 2013 | 1.7 |
| 2013 | 1.4 |
| 2013 | 1.5 |
| 2013 | 1.3 |
| 2013 | 1 |
| 2013 | 0.8 |
| 2013 | 0.8 |
| 2013 | 0.8 |
| 2013 | 0.9 |
| 2013 | 0.8 |
| 2013 | 1 |
| 2013 | 1.1 |
| 2013 | 1 |
| 2013 | 1.2 |
| 2013 | 1.5 |
| 2013 | 1.4 |
| 2013 | 1.2 |
| 2013 | 1.5 |
| 2013 | 1.5 |
| 2013 | 1.8 |
| 2013 | 1.8 |
| 2013 | 1.8 |
| 2013 | 1.8 |
| 2013 | 1.8 |
| 2013 | 1.5 |
| 2013 | 1.8 |
| 2013 | 1.8 |
| 2013 | 1.8 |
| 2013 | 1.7 |
| 2013 | 1.7 |
| 2013 | 1.4 |
| 2013 | 1.4 |
| 2013 | 1.5 |
| 2013 | 1.3 |
| 2013 | 1.4 |
| 2013 | 1.4 |
| 2013 | 1.6 |
| 2013 | 1.4 |
| 2013 | 1.5 |
| 2013 | 1.5 |
| 2013 | 1.8 |
| 2013 | 2 |
| 2013 | 1.9 |
| 2013 | 1.8 |
| 2013 | 1.7 |
| 2013 | 1.5 |
| 2013 | 1.2 |
| 2014 | 1.4 |
| 2014 | 1.3 |
| 2014 | 1.1 |
| 2014 | 0.8 |
| 2014 | 0.6 |
| 2014 | 0.9 |
| 2014 | 1.2 |
| 2014 | 1.5 |
| 2014 | 1.7 |
| 2014 | 2 |
| 2014 | 1.8 |
| 2014 | 1.9 |
| 2014 | 1.8 |
| 2014 | 2.1 |
| 2014 | 2 |
| 2014 | 2 |
| 2014 | 1.7 |
| 2014 | 1.7 |
| 2014 | 1.5 |
| 2014 | 1.3 |
| 2014 | 1.2 |
| 2014 | 1.1 |
| 2014 | 1.2 |
| 2014 | 1 |
| 2014 | 1.3 |
| 2014 | 1.3 |
| 2014 | 1.6 |
| 2014 | 1.6 |
| 2014 | 1.5 |
| 2014 | 1.7 |
| 2014 | 1.8 |
| 2014 | 2.1 |
| 2014 | 2 |
| 2014 | 1.9 |
| 2014 | 1.6 |
| 2014 | 1.3 |
| 2014 | 1.3 |
| 2014 | 1.1 |
| 2014 | 1.4 |
| 2015 | 1.4 |
| 2015 | 1.4 |
| 2015 | 1.4 |
| 2015 | 1.7 |
| 2015 | 1.7 |
| 2015 | 2 |
| 2015 | 2.3 |
| 2015 | 2.3 |
| 2015 | 2.2 |
| 2015 | 2 |
| 2015 | 2 |
| 2015 | 2 |
| 2015 | 1.8 |
| 2015 | 1.8 |
| 2015 | 2.1 |
| 2015 | 1.9 |
| 2015 | 1.9 |
| 2015 | 1.9 |
| 2015 | 2.2 |
| 2015 | 2.4 |
| 2015 | 2.2 |
| 2015 | 2.4 |
| 2015 | 2.6 |
| 2015 | 2.6 |
| 2015 | 2.6 |
| 2015 | 2.6 |
| 2015 | 2.3 |
| 2015 | 2.3 |
| 2015 | 2.1 |
| 2015 | 1.8 |
| 2015 | 1.7 |
| 2015 | 1.7 |
| 2015 | 1.7 |
| 2015 | 1.7 |
| 2015 | 1.7 |
| 2015 | 1.9 |
| 2015 | 1.9 |
| 2015 | 1.6 |
| 2015 | 1.8 |
| 2015 | 1.8 |
| 2015 | 2.1 |
| 2015 | 2.1 |
| 2015 | 2.1 |
| 2015 | 1.8 |
| 2015 | 1.8 |
| 2015 | 1.5 |
| 2015 | 1.8 |
| 2015 | 1.8 |
| 2015 | 1.8 |
| 2015 | 2.1 |
| 2015 | 1.8 |
| 2016 | 1.8 |
| 2016 | 1.5 |
| 2016 | 1.8 |
| 2016 | 1.5 |
| 2016 | 1.8 |
| 2016 | 1.5 |
| 2016 | 1.8 |
| 2016 | 1.8 |
| 2016 | 1.6 |
| 2016 | 1.6 |
| 2016 | 1.3 |
| 2016 | 1.4 |
| 2016 | 1.2 |
| 2016 | 1.5 |
| 2016 | 1.5 |
| 2016 | 1.5 |
| 2016 | 1.5 |
| 2016 | 1.3 |
| 2016 | 1.5 |
| 2016 | 1.8 |
| 2016 | 2.1 |
| 2016 | 2.1 |
| 2016 | 2 |
| 2016 | 2 |
| 2016 | 2 |
| 2016 | 2.3 |
| 2016 | 2.3 |
| 2016 | 2.3 |
| 2016 | 2 |
| 2016 | 1.8 |
| 2016 | 1.6 |
| 2016 | 1.8 |
| 2016 | 2.1 |
| 2016 | 2.1 |
| 2016 | 1.9 |
| 2016 | 1.6 |
| 2016 | 1.3 |
| 2016 | 1.3 |
| 2016 | 1.4 |
| 2016 | 1.3 |
| 2016 | 1.5 |
| 2016 | 1.5 |
| 2016 | 1.3 |
| 2016 | 1 |
| 2016 | 0.9 |
| 2016 | 0.9 |
| 2016 | 0.9 |
| 2016 | 0.9 |
| 2016 | 1.1 |
| 2016 | 1.2 |
| 2016 | 1.2 |
| 2016 | 0.9 |
| 2017 | 0.9 |
| 2017 | 1 |
| 2017 | 1 |